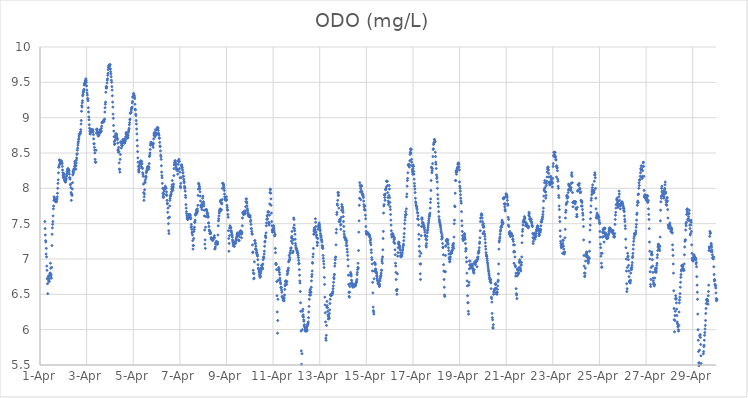
| Category | ODO (mg/L) |
|---|---|
| 44287.208333333336 | 7.53 |
| 44287.21875 | 7.43 |
| 44287.229166666664 | 7.34 |
| 44287.239583333336 | 7.26 |
| 44287.25 | 7.24 |
| 44287.260416666664 | 7.07 |
| 44287.270833333336 | 7.15 |
| 44287.28125 | 7.03 |
| 44287.291666666664 | 6.9 |
| 44287.302083333336 | 6.84 |
| 44287.3125 | 6.72 |
| 44287.322916666664 | 6.65 |
| 44287.333333333336 | 6.51 |
| 44287.34375 | 6.74 |
| 44287.354166666664 | 6.73 |
| 44287.364583333336 | 6.76 |
| 44287.375 | 6.69 |
| 44287.385416666664 | 6.69 |
| 44287.395833333336 | 6.68 |
| 44287.40625 | 6.72 |
| 44287.416666666664 | 6.77 |
| 44287.427083333336 | 6.8 |
| 44287.4375 | 6.8 |
| 44287.447916666664 | 6.94 |
| 44287.458333333336 | 6.87 |
| 44287.46875 | 6.76 |
| 44287.479166666664 | 6.78 |
| 44287.489583333336 | 6.73 |
| 44287.5 | 6.88 |
| 44287.510416666664 | 7.19 |
| 44287.520833333336 | 7.35 |
| 44287.53125 | 7.44 |
| 44287.541666666664 | 7.49 |
| 44287.552083333336 | 7.53 |
| 44287.5625 | 7.61 |
| 44287.572916666664 | 7.71 |
| 44287.583333333336 | 7.75 |
| 44287.59375 | 7.83 |
| 44287.604166666664 | 7.88 |
| 44287.614583333336 | 7.87 |
| 44287.625 | 7.85 |
| 44287.635416666664 | 7.84 |
| 44287.645833333336 | 7.84 |
| 44287.65625 | 7.82 |
| 44287.666666666664 | 7.82 |
| 44287.677083333336 | 7.81 |
| 44287.6875 | 7.81 |
| 44287.697916666664 | 7.82 |
| 44287.708333333336 | 7.81 |
| 44287.71875 | 7.84 |
| 44287.729166666664 | 7.85 |
| 44287.739583333336 | 7.88 |
| 44287.75 | 7.93 |
| 44287.760416666664 | 8 |
| 44287.770833333336 | 8.07 |
| 44287.78125 | 8.12 |
| 44287.791666666664 | 8.22 |
| 44287.802083333336 | 8.3 |
| 44287.8125 | 8.3 |
| 44287.822916666664 | 8.33 |
| 44287.833333333336 | 8.4 |
| 44287.84375 | 8.4 |
| 44287.854166666664 | 8.38 |
| 44287.864583333336 | 8.35 |
| 44287.875 | 8.35 |
| 44287.885416666664 | 8.37 |
| 44287.895833333336 | 8.38 |
| 44287.90625 | 8.38 |
| 44287.916666666664 | 8.39 |
| 44287.927083333336 | 8.37 |
| 44287.9375 | 8.36 |
| 44287.947916666664 | 8.35 |
| 44287.958333333336 | 8.31 |
| 44287.96875 | 8.26 |
| 44287.979166666664 | 8.22 |
| 44287.989583333336 | 8.18 |
| 44288.0 | 8.15 |
| 44288.010416666664 | 8.21 |
| 44288.020833333336 | 8.2 |
| 44288.03125 | 8.2 |
| 44288.041666666664 | 8.16 |
| 44288.052083333336 | 8.12 |
| 44288.0625 | 8.11 |
| 44288.072916666664 | 8.1 |
| 44288.083333333336 | 8.09 |
| 44288.09375 | 8.09 |
| 44288.104166666664 | 8.11 |
| 44288.114583333336 | 8.13 |
| 44288.125 | 8.14 |
| 44288.135416666664 | 8.17 |
| 44288.145833333336 | 8.19 |
| 44288.15625 | 8.21 |
| 44288.166666666664 | 8.24 |
| 44288.177083333336 | 8.26 |
| 44288.1875 | 8.27 |
| 44288.197916666664 | 8.27 |
| 44288.208333333336 | 8.28 |
| 44288.21875 | 8.25 |
| 44288.229166666664 | 8.26 |
| 44288.239583333336 | 8.23 |
| 44288.25 | 8.25 |
| 44288.260416666664 | 8.2 |
| 44288.270833333336 | 8.15 |
| 44288.28125 | 8.15 |
| 44288.291666666664 | 8.13 |
| 44288.302083333336 | 8.05 |
| 44288.3125 | 8.06 |
| 44288.322916666664 | 8.01 |
| 44288.333333333336 | 7.94 |
| 44288.34375 | 7.83 |
| 44288.354166666664 | 7.92 |
| 44288.364583333336 | 7.91 |
| 44288.375 | 7.9 |
| 44288.385416666664 | 7.99 |
| 44288.395833333336 | 8.08 |
| 44288.40625 | 8.19 |
| 44288.416666666664 | 8.24 |
| 44288.427083333336 | 8.21 |
| 44288.4375 | 8.23 |
| 44288.447916666664 | 8.27 |
| 44288.458333333336 | 8.27 |
| 44288.46875 | 8.27 |
| 44288.479166666664 | 8.31 |
| 44288.489583333336 | 8.38 |
| 44288.5 | 8.35 |
| 44288.510416666664 | 8.33 |
| 44288.520833333336 | 8.28 |
| 44288.53125 | 8.27 |
| 44288.541666666664 | 8.32 |
| 44288.552083333336 | 8.36 |
| 44288.5625 | 8.4 |
| 44288.572916666664 | 8.43 |
| 44288.583333333336 | 8.48 |
| 44288.59375 | 8.49 |
| 44288.604166666664 | 8.54 |
| 44288.614583333336 | 8.57 |
| 44288.625 | 8.61 |
| 44288.635416666664 | 8.64 |
| 44288.645833333336 | 8.66 |
| 44288.65625 | 8.69 |
| 44288.666666666664 | 8.71 |
| 44288.677083333336 | 8.74 |
| 44288.6875 | 8.76 |
| 44288.697916666664 | 8.77 |
| 44288.708333333336 | 8.77 |
| 44288.71875 | 8.77 |
| 44288.729166666664 | 8.78 |
| 44288.739583333336 | 8.8 |
| 44288.75 | 8.83 |
| 44288.760416666664 | 8.91 |
| 44288.770833333336 | 8.96 |
| 44288.78125 | 9.09 |
| 44288.791666666664 | 9.17 |
| 44288.802083333336 | 9.15 |
| 44288.8125 | 9.21 |
| 44288.822916666664 | 9.24 |
| 44288.833333333336 | 9.31 |
| 44288.84375 | 9.33 |
| 44288.854166666664 | 9.36 |
| 44288.864583333336 | 9.37 |
| 44288.875 | 9.39 |
| 44288.885416666664 | 9.4 |
| 44288.895833333336 | 9.46 |
| 44288.90625 | 9.48 |
| 44288.916666666664 | 9.49 |
| 44288.927083333336 | 9.47 |
| 44288.9375 | 9.52 |
| 44288.947916666664 | 9.52 |
| 44288.958333333336 | 9.53 |
| 44288.96875 | 9.55 |
| 44288.979166666664 | 9.53 |
| 44288.989583333336 | 9.5 |
| 44289.0 | 9.45 |
| 44289.010416666664 | 9.39 |
| 44289.020833333336 | 9.35 |
| 44289.03125 | 9.32 |
| 44289.041666666664 | 9.27 |
| 44289.052083333336 | 9.27 |
| 44289.0625 | 9.24 |
| 44289.072916666664 | 9.14 |
| 44289.083333333336 | 9.08 |
| 44289.09375 | 9.01 |
| 44289.104166666664 | 8.97 |
| 44289.114583333336 | 8.9 |
| 44289.125 | 8.85 |
| 44289.135416666664 | 8.81 |
| 44289.145833333336 | 8.77 |
| 44289.15625 | 8.77 |
| 44289.166666666664 | 8.79 |
| 44289.177083333336 | 8.81 |
| 44289.1875 | 8.81 |
| 44289.197916666664 | 8.82 |
| 44289.208333333336 | 8.83 |
| 44289.21875 | 8.82 |
| 44289.229166666664 | 8.83 |
| 44289.239583333336 | 8.83 |
| 44289.25 | 8.8 |
| 44289.260416666664 | 8.8 |
| 44289.270833333336 | 8.83 |
| 44289.28125 | 8.8 |
| 44289.291666666664 | 8.76 |
| 44289.302083333336 | 8.7 |
| 44289.3125 | 8.63 |
| 44289.322916666664 | 8.63 |
| 44289.333333333336 | 8.58 |
| 44289.34375 | 8.54 |
| 44289.354166666664 | 8.5 |
| 44289.364583333336 | 8.41 |
| 44289.375 | 8.37 |
| 44289.385416666664 | 8.37 |
| 44289.395833333336 | 8.37 |
| 44289.40625 | 8.54 |
| 44289.416666666664 | 8.78 |
| 44289.427083333336 | 8.83 |
| 44289.4375 | 8.84 |
| 44289.447916666664 | 8.83 |
| 44289.458333333336 | 8.8 |
| 44289.46875 | 8.79 |
| 44289.479166666664 | 8.78 |
| 44289.489583333336 | 8.75 |
| 44289.5 | 8.74 |
| 44289.510416666664 | 8.75 |
| 44289.520833333336 | 8.75 |
| 44289.53125 | 8.76 |
| 44289.541666666664 | 8.78 |
| 44289.552083333336 | 8.8 |
| 44289.5625 | 8.81 |
| 44289.572916666664 | 8.83 |
| 44289.583333333336 | 8.8 |
| 44289.59375 | 8.79 |
| 44289.604166666664 | 8.8 |
| 44289.614583333336 | 8.81 |
| 44289.625 | 8.81 |
| 44289.635416666664 | 8.85 |
| 44289.645833333336 | 8.88 |
| 44289.65625 | 8.93 |
| 44289.666666666664 | 8.93 |
| 44289.677083333336 | 8.94 |
| 44289.6875 | 8.94 |
| 44289.697916666664 | 8.94 |
| 44289.708333333336 | 8.94 |
| 44289.71875 | 8.95 |
| 44289.729166666664 | 8.94 |
| 44289.739583333336 | 8.95 |
| 44289.75 | 8.97 |
| 44289.760416666664 | 8.97 |
| 44289.770833333336 | 8.98 |
| 44289.78125 | 9.08 |
| 44289.791666666664 | 9.14 |
| 44289.802083333336 | 9.19 |
| 44289.8125 | 9.22 |
| 44289.822916666664 | 9.36 |
| 44289.833333333336 | 9.42 |
| 44289.84375 | 9.44 |
| 44289.854166666664 | 9.44 |
| 44289.864583333336 | 9.42 |
| 44289.875 | 9.49 |
| 44289.885416666664 | 9.53 |
| 44289.895833333336 | 9.55 |
| 44289.90625 | 9.6 |
| 44289.916666666664 | 9.63 |
| 44289.927083333336 | 9.68 |
| 44289.9375 | 9.71 |
| 44289.947916666664 | 9.73 |
| 44289.958333333336 | 9.74 |
| 44289.96875 | 9.74 |
| 44289.979166666664 | 9.75 |
| 44289.989583333336 | 9.73 |
| 44290.0 | 9.69 |
| 44290.010416666664 | 9.75 |
| 44290.020833333336 | 9.69 |
| 44290.03125 | 9.65 |
| 44290.041666666664 | 9.62 |
| 44290.052083333336 | 9.58 |
| 44290.0625 | 9.53 |
| 44290.072916666664 | 9.5 |
| 44290.083333333336 | 9.44 |
| 44290.09375 | 9.39 |
| 44290.104166666664 | 9.31 |
| 44290.114583333336 | 9.22 |
| 44290.125 | 9.15 |
| 44290.135416666664 | 9.05 |
| 44290.145833333336 | 8.99 |
| 44290.15625 | 8.89 |
| 44290.166666666664 | 8.81 |
| 44290.177083333336 | 8.73 |
| 44290.1875 | 8.66 |
| 44290.197916666664 | 8.62 |
| 44290.208333333336 | 8.63 |
| 44290.21875 | 8.68 |
| 44290.229166666664 | 8.72 |
| 44290.239583333336 | 8.75 |
| 44290.25 | 8.77 |
| 44290.260416666664 | 8.77 |
| 44290.270833333336 | 8.77 |
| 44290.28125 | 8.76 |
| 44290.291666666664 | 8.74 |
| 44290.302083333336 | 8.71 |
| 44290.3125 | 8.71 |
| 44290.322916666664 | 8.69 |
| 44290.333333333336 | 8.64 |
| 44290.34375 | 8.54 |
| 44290.354166666664 | 8.55 |
| 44290.364583333336 | 8.51 |
| 44290.375 | 8.58 |
| 44290.385416666664 | 8.52 |
| 44290.395833333336 | 8.36 |
| 44290.40625 | 8.27 |
| 44290.416666666664 | 8.27 |
| 44290.427083333336 | 8.23 |
| 44290.4375 | 8.41 |
| 44290.447916666664 | 8.48 |
| 44290.458333333336 | 8.65 |
| 44290.46875 | 8.66 |
| 44290.479166666664 | 8.65 |
| 44290.489583333336 | 8.57 |
| 44290.5 | 8.61 |
| 44290.510416666664 | 8.61 |
| 44290.520833333336 | 8.6 |
| 44290.53125 | 8.61 |
| 44290.541666666664 | 8.64 |
| 44290.552083333336 | 8.69 |
| 44290.5625 | 8.67 |
| 44290.572916666664 | 8.66 |
| 44290.583333333336 | 8.66 |
| 44290.59375 | 8.65 |
| 44290.604166666664 | 8.67 |
| 44290.614583333336 | 8.7 |
| 44290.625 | 8.64 |
| 44290.635416666664 | 8.64 |
| 44290.645833333336 | 8.66 |
| 44290.65625 | 8.67 |
| 44290.666666666664 | 8.69 |
| 44290.677083333336 | 8.73 |
| 44290.6875 | 8.77 |
| 44290.697916666664 | 8.79 |
| 44290.708333333336 | 8.78 |
| 44290.71875 | 8.76 |
| 44290.729166666664 | 8.75 |
| 44290.739583333336 | 8.72 |
| 44290.75 | 8.72 |
| 44290.760416666664 | 8.71 |
| 44290.770833333336 | 8.72 |
| 44290.78125 | 8.75 |
| 44290.791666666664 | 8.79 |
| 44290.802083333336 | 8.81 |
| 44290.8125 | 8.83 |
| 44290.822916666664 | 8.85 |
| 44290.833333333336 | 8.9 |
| 44290.84375 | 8.93 |
| 44290.854166666664 | 8.97 |
| 44290.864583333336 | 8.98 |
| 44290.875 | 9.06 |
| 44290.885416666664 | 9.07 |
| 44290.895833333336 | 9.07 |
| 44290.90625 | 9.08 |
| 44290.916666666664 | 9.11 |
| 44290.927083333336 | 9.13 |
| 44290.9375 | 9.14 |
| 44290.947916666664 | 9.15 |
| 44290.958333333336 | 9.21 |
| 44290.96875 | 9.23 |
| 44290.979166666664 | 9.29 |
| 44290.989583333336 | 9.3 |
| 44291.0 | 9.3 |
| 44291.010416666664 | 9.34 |
| 44291.020833333336 | 9.34 |
| 44291.03125 | 9.32 |
| 44291.041666666664 | 9.31 |
| 44291.052083333336 | 9.29 |
| 44291.0625 | 9.27 |
| 44291.072916666664 | 9.19 |
| 44291.083333333336 | 9.12 |
| 44291.09375 | 9.11 |
| 44291.104166666664 | 9.05 |
| 44291.114583333336 | 9.03 |
| 44291.125 | 8.96 |
| 44291.135416666664 | 8.91 |
| 44291.145833333336 | 8.84 |
| 44291.15625 | 8.77 |
| 44291.166666666664 | 8.68 |
| 44291.177083333336 | 8.6 |
| 44291.1875 | 8.52 |
| 44291.197916666664 | 8.43 |
| 44291.208333333336 | 8.37 |
| 44291.21875 | 8.31 |
| 44291.229166666664 | 8.26 |
| 44291.239583333336 | 8.23 |
| 44291.25 | 8.24 |
| 44291.260416666664 | 8.28 |
| 44291.270833333336 | 8.31 |
| 44291.28125 | 8.34 |
| 44291.291666666664 | 8.36 |
| 44291.302083333336 | 8.37 |
| 44291.3125 | 8.38 |
| 44291.322916666664 | 8.39 |
| 44291.333333333336 | 8.35 |
| 44291.34375 | 8.31 |
| 44291.354166666664 | 8.34 |
| 44291.364583333336 | 8.38 |
| 44291.375 | 8.35 |
| 44291.385416666664 | 8.29 |
| 44291.395833333336 | 8.28 |
| 44291.40625 | 8.22 |
| 44291.416666666664 | 8.2 |
| 44291.427083333336 | 8.17 |
| 44291.4375 | 8.06 |
| 44291.447916666664 | 7.94 |
| 44291.458333333336 | 7.83 |
| 44291.46875 | 7.88 |
| 44291.479166666664 | 7.92 |
| 44291.489583333336 | 7.98 |
| 44291.5 | 8.09 |
| 44291.510416666664 | 8.08 |
| 44291.520833333336 | 8.12 |
| 44291.53125 | 8.17 |
| 44291.541666666664 | 8.15 |
| 44291.552083333336 | 8.17 |
| 44291.5625 | 8.22 |
| 44291.572916666664 | 8.24 |
| 44291.583333333336 | 8.25 |
| 44291.59375 | 8.27 |
| 44291.604166666664 | 8.28 |
| 44291.614583333336 | 8.3 |
| 44291.625 | 8.31 |
| 44291.635416666664 | 8.31 |
| 44291.645833333336 | 8.3 |
| 44291.65625 | 8.3 |
| 44291.666666666664 | 8.27 |
| 44291.677083333336 | 8.3 |
| 44291.6875 | 8.35 |
| 44291.697916666664 | 8.45 |
| 44291.708333333336 | 8.47 |
| 44291.71875 | 8.5 |
| 44291.729166666664 | 8.55 |
| 44291.739583333336 | 8.61 |
| 44291.75 | 8.63 |
| 44291.760416666664 | 8.65 |
| 44291.770833333336 | 8.65 |
| 44291.78125 | 8.63 |
| 44291.791666666664 | 8.64 |
| 44291.802083333336 | 8.64 |
| 44291.8125 | 8.62 |
| 44291.822916666664 | 8.61 |
| 44291.833333333336 | 8.62 |
| 44291.84375 | 8.62 |
| 44291.854166666664 | 8.58 |
| 44291.864583333336 | 8.64 |
| 44291.875 | 8.7 |
| 44291.885416666664 | 8.77 |
| 44291.895833333336 | 8.75 |
| 44291.90625 | 8.79 |
| 44291.916666666664 | 8.76 |
| 44291.927083333336 | 8.76 |
| 44291.9375 | 8.73 |
| 44291.947916666664 | 8.83 |
| 44291.958333333336 | 8.79 |
| 44291.96875 | 8.76 |
| 44291.979166666664 | 8.76 |
| 44291.989583333336 | 8.78 |
| 44292.0 | 8.77 |
| 44292.010416666664 | 8.83 |
| 44292.020833333336 | 8.83 |
| 44292.03125 | 8.86 |
| 44292.041666666664 | 8.84 |
| 44292.052083333336 | 8.86 |
| 44292.0625 | 8.85 |
| 44292.072916666664 | 8.82 |
| 44292.083333333336 | 8.78 |
| 44292.09375 | 8.77 |
| 44292.104166666664 | 8.75 |
| 44292.114583333336 | 8.71 |
| 44292.125 | 8.71 |
| 44292.135416666664 | 8.65 |
| 44292.145833333336 | 8.6 |
| 44292.15625 | 8.59 |
| 44292.166666666664 | 8.53 |
| 44292.177083333336 | 8.47 |
| 44292.1875 | 8.45 |
| 44292.197916666664 | 8.41 |
| 44292.208333333336 | 8.32 |
| 44292.21875 | 8.23 |
| 44292.229166666664 | 8.18 |
| 44292.239583333336 | 8.15 |
| 44292.25 | 8.07 |
| 44292.260416666664 | 8 |
| 44292.270833333336 | 7.93 |
| 44292.28125 | 7.89 |
| 44292.291666666664 | 7.87 |
| 44292.302083333336 | 7.88 |
| 44292.3125 | 7.92 |
| 44292.322916666664 | 7.96 |
| 44292.333333333336 | 7.98 |
| 44292.34375 | 8 |
| 44292.354166666664 | 8.01 |
| 44292.364583333336 | 8.01 |
| 44292.375 | 8.03 |
| 44292.385416666664 | 8 |
| 44292.395833333336 | 8.01 |
| 44292.40625 | 8 |
| 44292.416666666664 | 7.91 |
| 44292.427083333336 | 7.95 |
| 44292.4375 | 7.9 |
| 44292.447916666664 | 7.83 |
| 44292.458333333336 | 7.78 |
| 44292.46875 | 7.79 |
| 44292.479166666664 | 7.66 |
| 44292.489583333336 | 7.72 |
| 44292.5 | 7.58 |
| 44292.510416666664 | 7.5 |
| 44292.520833333336 | 7.4 |
| 44292.53125 | 7.36 |
| 44292.541666666664 | 7.59 |
| 44292.552083333336 | 7.59 |
| 44292.5625 | 7.75 |
| 44292.572916666664 | 7.83 |
| 44292.583333333336 | 7.86 |
| 44292.59375 | 7.89 |
| 44292.604166666664 | 7.9 |
| 44292.614583333336 | 7.91 |
| 44292.625 | 7.92 |
| 44292.635416666664 | 7.95 |
| 44292.645833333336 | 7.99 |
| 44292.65625 | 8.02 |
| 44292.666666666664 | 8.05 |
| 44292.677083333336 | 8.11 |
| 44292.6875 | 7.99 |
| 44292.697916666664 | 7.97 |
| 44292.708333333336 | 8.01 |
| 44292.71875 | 8.03 |
| 44292.729166666664 | 8.06 |
| 44292.739583333336 | 8.18 |
| 44292.75 | 8.28 |
| 44292.760416666664 | 8.33 |
| 44292.770833333336 | 8.36 |
| 44292.78125 | 8.37 |
| 44292.791666666664 | 8.39 |
| 44292.802083333336 | 8.39 |
| 44292.8125 | 8.37 |
| 44292.822916666664 | 8.35 |
| 44292.833333333336 | 8.33 |
| 44292.84375 | 8.3 |
| 44292.854166666664 | 8.27 |
| 44292.864583333336 | 8.26 |
| 44292.875 | 8.26 |
| 44292.885416666664 | 8.27 |
| 44292.895833333336 | 8.27 |
| 44292.90625 | 8.2 |
| 44292.916666666664 | 8.25 |
| 44292.927083333336 | 8.34 |
| 44292.9375 | 8.39 |
| 44292.947916666664 | 8.38 |
| 44292.958333333336 | 8.41 |
| 44292.96875 | 8.38 |
| 44292.979166666664 | 8.38 |
| 44292.989583333336 | 8.28 |
| 44293.0 | 8.23 |
| 44293.010416666664 | 8.15 |
| 44293.020833333336 | 8.03 |
| 44293.03125 | 8.01 |
| 44293.041666666664 | 8.07 |
| 44293.052083333336 | 8.15 |
| 44293.0625 | 8.32 |
| 44293.072916666664 | 8.33 |
| 44293.083333333336 | 8.33 |
| 44293.09375 | 8.3 |
| 44293.104166666664 | 8.29 |
| 44293.114583333336 | 8.26 |
| 44293.125 | 8.22 |
| 44293.135416666664 | 8.22 |
| 44293.145833333336 | 8.17 |
| 44293.15625 | 8.17 |
| 44293.166666666664 | 8.13 |
| 44293.177083333336 | 8.1 |
| 44293.1875 | 8.08 |
| 44293.197916666664 | 8.03 |
| 44293.208333333336 | 8 |
| 44293.21875 | 8.01 |
| 44293.229166666664 | 7.96 |
| 44293.239583333336 | 7.9 |
| 44293.25 | 7.87 |
| 44293.260416666664 | 7.77 |
| 44293.270833333336 | 7.72 |
| 44293.28125 | 7.67 |
| 44293.291666666664 | 7.64 |
| 44293.302083333336 | 7.61 |
| 44293.3125 | 7.58 |
| 44293.322916666664 | 7.57 |
| 44293.333333333336 | 7.56 |
| 44293.34375 | 7.56 |
| 44293.354166666664 | 7.57 |
| 44293.364583333336 | 7.58 |
| 44293.375 | 7.6 |
| 44293.385416666664 | 7.62 |
| 44293.395833333336 | 7.63 |
| 44293.40625 | 7.63 |
| 44293.416666666664 | 7.63 |
| 44293.427083333336 | 7.63 |
| 44293.4375 | 7.58 |
| 44293.447916666664 | 7.62 |
| 44293.458333333336 | 7.59 |
| 44293.46875 | 7.57 |
| 44293.479166666664 | 7.45 |
| 44293.489583333336 | 7.49 |
| 44293.5 | 7.46 |
| 44293.510416666664 | 7.42 |
| 44293.520833333336 | 7.37 |
| 44293.53125 | 7.38 |
| 44293.541666666664 | 7.34 |
| 44293.552083333336 | 7.26 |
| 44293.5625 | 7.14 |
| 44293.572916666664 | 7.19 |
| 44293.583333333336 | 7.19 |
| 44293.59375 | 7.29 |
| 44293.604166666664 | 7.39 |
| 44293.614583333336 | 7.42 |
| 44293.625 | 7.45 |
| 44293.635416666664 | 7.52 |
| 44293.645833333336 | 7.52 |
| 44293.65625 | 7.55 |
| 44293.666666666664 | 7.62 |
| 44293.677083333336 | 7.64 |
| 44293.6875 | 7.63 |
| 44293.697916666664 | 7.65 |
| 44293.708333333336 | 7.68 |
| 44293.71875 | 7.7 |
| 44293.729166666664 | 7.66 |
| 44293.739583333336 | 7.65 |
| 44293.75 | 7.71 |
| 44293.760416666664 | 7.68 |
| 44293.770833333336 | 7.76 |
| 44293.78125 | 7.9 |
| 44293.791666666664 | 7.99 |
| 44293.802083333336 | 8.07 |
| 44293.8125 | 8.06 |
| 44293.822916666664 | 8.06 |
| 44293.833333333336 | 8.03 |
| 44293.84375 | 8.02 |
| 44293.854166666664 | 7.99 |
| 44293.864583333336 | 7.95 |
| 44293.875 | 7.89 |
| 44293.885416666664 | 7.82 |
| 44293.895833333336 | 7.76 |
| 44293.90625 | 7.75 |
| 44293.916666666664 | 7.73 |
| 44293.927083333336 | 7.74 |
| 44293.9375 | 7.74 |
| 44293.947916666664 | 7.7 |
| 44293.958333333336 | 7.76 |
| 44293.96875 | 7.79 |
| 44293.979166666664 | 7.86 |
| 44293.989583333336 | 7.89 |
| 44294.0 | 7.8 |
| 44294.010416666664 | 7.81 |
| 44294.020833333336 | 7.78 |
| 44294.03125 | 7.75 |
| 44294.041666666664 | 7.69 |
| 44294.052083333336 | 7.61 |
| 44294.0625 | 7.41 |
| 44294.072916666664 | 7.21 |
| 44294.083333333336 | 7.27 |
| 44294.09375 | 7.15 |
| 44294.104166666664 | 7.45 |
| 44294.114583333336 | 7.6 |
| 44294.125 | 7.7 |
| 44294.135416666664 | 7.69 |
| 44294.145833333336 | 7.7 |
| 44294.15625 | 7.68 |
| 44294.166666666664 | 7.65 |
| 44294.177083333336 | 7.64 |
| 44294.1875 | 7.65 |
| 44294.197916666664 | 7.62 |
| 44294.208333333336 | 7.59 |
| 44294.21875 | 7.6 |
| 44294.229166666664 | 7.51 |
| 44294.239583333336 | 7.51 |
| 44294.25 | 7.46 |
| 44294.260416666664 | 7.41 |
| 44294.270833333336 | 7.4 |
| 44294.28125 | 7.39 |
| 44294.291666666664 | 7.36 |
| 44294.302083333336 | 7.36 |
| 44294.3125 | 7.38 |
| 44294.322916666664 | 7.36 |
| 44294.333333333336 | 7.3 |
| 44294.34375 | 7.28 |
| 44294.354166666664 | 7.29 |
| 44294.364583333336 | 7.3 |
| 44294.375 | 7.29 |
| 44294.385416666664 | 7.29 |
| 44294.395833333336 | 7.27 |
| 44294.40625 | 7.26 |
| 44294.416666666664 | 7.27 |
| 44294.427083333336 | 7.28 |
| 44294.4375 | 7.29 |
| 44294.447916666664 | 7.3 |
| 44294.458333333336 | 7.3 |
| 44294.46875 | 7.3 |
| 44294.479166666664 | 7.33 |
| 44294.489583333336 | 7.3 |
| 44294.5 | 7.14 |
| 44294.510416666664 | 7.15 |
| 44294.520833333336 | 7.17 |
| 44294.53125 | 7.21 |
| 44294.541666666664 | 7.23 |
| 44294.552083333336 | 7.22 |
| 44294.5625 | 7.25 |
| 44294.572916666664 | 7.23 |
| 44294.583333333336 | 7.21 |
| 44294.59375 | 7.22 |
| 44294.604166666664 | 7.21 |
| 44294.614583333336 | 7.21 |
| 44294.625 | 7.24 |
| 44294.635416666664 | 7.34 |
| 44294.645833333336 | 7.47 |
| 44294.65625 | 7.54 |
| 44294.666666666664 | 7.57 |
| 44294.677083333336 | 7.61 |
| 44294.6875 | 7.65 |
| 44294.697916666664 | 7.69 |
| 44294.708333333336 | 7.67 |
| 44294.71875 | 7.68 |
| 44294.729166666664 | 7.71 |
| 44294.739583333336 | 7.81 |
| 44294.75 | 7.83 |
| 44294.760416666664 | 7.83 |
| 44294.770833333336 | 7.69 |
| 44294.78125 | 7.7 |
| 44294.791666666664 | 7.78 |
| 44294.802083333336 | 7.79 |
| 44294.8125 | 7.84 |
| 44294.822916666664 | 8 |
| 44294.833333333336 | 8.07 |
| 44294.84375 | 8.07 |
| 44294.854166666664 | 8.07 |
| 44294.864583333336 | 8.05 |
| 44294.875 | 8.05 |
| 44294.885416666664 | 8.03 |
| 44294.895833333336 | 8 |
| 44294.90625 | 7.97 |
| 44294.916666666664 | 7.92 |
| 44294.927083333336 | 7.88 |
| 44294.9375 | 7.86 |
| 44294.947916666664 | 7.84 |
| 44294.958333333336 | 7.84 |
| 44294.96875 | 7.85 |
| 44294.979166666664 | 7.83 |
| 44294.989583333336 | 7.83 |
| 44295.0 | 7.88 |
| 44295.010416666664 | 7.84 |
| 44295.020833333336 | 7.76 |
| 44295.03125 | 7.73 |
| 44295.041666666664 | 7.7 |
| 44295.052083333336 | 7.69 |
| 44295.0625 | 7.63 |
| 44295.072916666664 | 7.59 |
| 44295.083333333336 | 7.4 |
| 44295.09375 | 7.29 |
| 44295.104166666664 | 7.11 |
| 44295.114583333336 | 7.22 |
| 44295.125 | 7.33 |
| 44295.135416666664 | 7.44 |
| 44295.145833333336 | 7.47 |
| 44295.15625 | 7.44 |
| 44295.166666666664 | 7.44 |
| 44295.177083333336 | 7.45 |
| 44295.1875 | 7.44 |
| 44295.197916666664 | 7.4 |
| 44295.208333333336 | 7.39 |
| 44295.21875 | 7.37 |
| 44295.229166666664 | 7.35 |
| 44295.239583333336 | 7.33 |
| 44295.25 | 7.31 |
| 44295.260416666664 | 7.27 |
| 44295.270833333336 | 7.25 |
| 44295.28125 | 7.23 |
| 44295.291666666664 | 7.19 |
| 44295.302083333336 | 7.21 |
| 44295.3125 | 7.22 |
| 44295.322916666664 | 7.18 |
| 44295.333333333336 | 7.18 |
| 44295.34375 | 7.22 |
| 44295.354166666664 | 7.24 |
| 44295.364583333336 | 7.23 |
| 44295.375 | 7.23 |
| 44295.385416666664 | 7.22 |
| 44295.395833333336 | 7.23 |
| 44295.40625 | 7.26 |
| 44295.416666666664 | 7.28 |
| 44295.427083333336 | 7.3 |
| 44295.4375 | 7.31 |
| 44295.447916666664 | 7.34 |
| 44295.458333333336 | 7.35 |
| 44295.46875 | 7.36 |
| 44295.479166666664 | 7.37 |
| 44295.489583333336 | 7.33 |
| 44295.5 | 7.34 |
| 44295.510416666664 | 7.34 |
| 44295.520833333336 | 7.27 |
| 44295.53125 | 7.26 |
| 44295.541666666664 | 7.26 |
| 44295.552083333336 | 7.32 |
| 44295.5625 | 7.36 |
| 44295.572916666664 | 7.38 |
| 44295.583333333336 | 7.39 |
| 44295.59375 | 7.37 |
| 44295.604166666664 | 7.39 |
| 44295.614583333336 | 7.4 |
| 44295.625 | 7.37 |
| 44295.635416666664 | 7.35 |
| 44295.645833333336 | 7.3 |
| 44295.65625 | 7.36 |
| 44295.666666666664 | 7.38 |
| 44295.677083333336 | 7.47 |
| 44295.6875 | 7.58 |
| 44295.697916666664 | 7.65 |
| 44295.708333333336 | 7.66 |
| 44295.71875 | 7.66 |
| 44295.729166666664 | 7.63 |
| 44295.739583333336 | 7.63 |
| 44295.75 | 7.64 |
| 44295.760416666664 | 7.66 |
| 44295.770833333336 | 7.68 |
| 44295.78125 | 7.67 |
| 44295.791666666664 | 7.64 |
| 44295.802083333336 | 7.64 |
| 44295.8125 | 7.68 |
| 44295.822916666664 | 7.74 |
| 44295.833333333336 | 7.81 |
| 44295.84375 | 7.85 |
| 44295.854166666664 | 7.85 |
| 44295.864583333336 | 7.81 |
| 44295.875 | 7.79 |
| 44295.885416666664 | 7.75 |
| 44295.895833333336 | 7.71 |
| 44295.90625 | 7.69 |
| 44295.916666666664 | 7.66 |
| 44295.927083333336 | 7.64 |
| 44295.9375 | 7.62 |
| 44295.947916666664 | 7.61 |
| 44295.958333333336 | 7.61 |
| 44295.96875 | 7.6 |
| 44295.979166666664 | 7.6 |
| 44295.989583333336 | 7.61 |
| 44296.0 | 7.62 |
| 44296.010416666664 | 7.61 |
| 44296.020833333336 | 7.59 |
| 44296.03125 | 7.53 |
| 44296.041666666664 | 7.55 |
| 44296.052083333336 | 7.49 |
| 44296.0625 | 7.43 |
| 44296.072916666664 | 7.43 |
| 44296.083333333336 | 7.39 |
| 44296.09375 | 7.36 |
| 44296.104166666664 | 7.35 |
| 44296.114583333336 | 7.2 |
| 44296.125 | 7.09 |
| 44296.135416666664 | 7.1 |
| 44296.145833333336 | 6.84 |
| 44296.15625 | 6.8 |
| 44296.166666666664 | 6.72 |
| 44296.177083333336 | 6.79 |
| 44296.1875 | 6.73 |
| 44296.197916666664 | 6.96 |
| 44296.208333333336 | 7.26 |
| 44296.21875 | 7.26 |
| 44296.229166666664 | 7.22 |
| 44296.239583333336 | 7.14 |
| 44296.25 | 7.22 |
| 44296.260416666664 | 7.18 |
| 44296.270833333336 | 7.14 |
| 44296.28125 | 7.09 |
| 44296.291666666664 | 7.12 |
| 44296.302083333336 | 7.09 |
| 44296.3125 | 7.06 |
| 44296.322916666664 | 7.06 |
| 44296.333333333336 | 7.04 |
| 44296.34375 | 6.99 |
| 44296.354166666664 | 6.92 |
| 44296.364583333336 | 6.87 |
| 44296.375 | 6.86 |
| 44296.385416666664 | 6.86 |
| 44296.395833333336 | 6.83 |
| 44296.40625 | 6.81 |
| 44296.416666666664 | 6.78 |
| 44296.427083333336 | 6.76 |
| 44296.4375 | 6.74 |
| 44296.447916666664 | 6.75 |
| 44296.458333333336 | 6.76 |
| 44296.46875 | 6.8 |
| 44296.479166666664 | 6.83 |
| 44296.489583333336 | 6.86 |
| 44296.5 | 6.88 |
| 44296.510416666664 | 6.91 |
| 44296.520833333336 | 6.91 |
| 44296.53125 | 6.88 |
| 44296.541666666664 | 6.87 |
| 44296.552083333336 | 6.86 |
| 44296.5625 | 6.93 |
| 44296.572916666664 | 6.99 |
| 44296.583333333336 | 7.02 |
| 44296.59375 | 7.03 |
| 44296.604166666664 | 7.02 |
| 44296.614583333336 | 7.07 |
| 44296.625 | 7.11 |
| 44296.635416666664 | 7.18 |
| 44296.645833333336 | 7.24 |
| 44296.65625 | 7.25 |
| 44296.666666666664 | 7.33 |
| 44296.677083333336 | 7.32 |
| 44296.6875 | 7.3 |
| 44296.697916666664 | 7.37 |
| 44296.708333333336 | 7.47 |
| 44296.71875 | 7.51 |
| 44296.729166666664 | 7.56 |
| 44296.739583333336 | 7.61 |
| 44296.75 | 7.57 |
| 44296.760416666664 | 7.57 |
| 44296.770833333336 | 7.62 |
| 44296.78125 | 7.67 |
| 44296.791666666664 | 7.66 |
| 44296.802083333336 | 7.67 |
| 44296.8125 | 7.52 |
| 44296.822916666664 | 7.48 |
| 44296.833333333336 | 7.5 |
| 44296.84375 | 7.62 |
| 44296.854166666664 | 7.78 |
| 44296.864583333336 | 7.94 |
| 44296.875 | 7.99 |
| 44296.885416666664 | 7.98 |
| 44296.895833333336 | 7.93 |
| 44296.90625 | 7.85 |
| 44296.916666666664 | 7.76 |
| 44296.927083333336 | 7.65 |
| 44296.9375 | 7.53 |
| 44296.947916666664 | 7.47 |
| 44296.958333333336 | 7.41 |
| 44296.96875 | 7.38 |
| 44296.979166666664 | 7.41 |
| 44296.989583333336 | 7.4 |
| 44297.0 | 7.43 |
| 44297.010416666664 | 7.47 |
| 44297.020833333336 | 7.47 |
| 44297.03125 | 7.44 |
| 44297.041666666664 | 7.41 |
| 44297.052083333336 | 7.38 |
| 44297.0625 | 7.33 |
| 44297.072916666664 | 7.33 |
| 44297.083333333336 | 7.35 |
| 44297.09375 | 7.15 |
| 44297.104166666664 | 7.09 |
| 44297.114583333336 | 6.93 |
| 44297.125 | 6.94 |
| 44297.135416666664 | 6.92 |
| 44297.145833333336 | 6.85 |
| 44297.15625 | 6.68 |
| 44297.166666666664 | 6.48 |
| 44297.177083333336 | 6.25 |
| 44297.1875 | 5.95 |
| 44297.197916666664 | 6.13 |
| 44297.208333333336 | 6.43 |
| 44297.21875 | 6.7 |
| 44297.229166666664 | 6.84 |
| 44297.239583333336 | 6.88 |
| 44297.25 | 6.86 |
| 44297.260416666664 | 6.85 |
| 44297.270833333336 | 6.81 |
| 44297.28125 | 6.78 |
| 44297.291666666664 | 6.73 |
| 44297.302083333336 | 6.7 |
| 44297.3125 | 6.67 |
| 44297.322916666664 | 6.65 |
| 44297.333333333336 | 6.6 |
| 44297.34375 | 6.59 |
| 44297.354166666664 | 6.6 |
| 44297.364583333336 | 6.56 |
| 44297.375 | 6.53 |
| 44297.385416666664 | 6.47 |
| 44297.395833333336 | 6.46 |
| 44297.40625 | 6.46 |
| 44297.416666666664 | 6.46 |
| 44297.427083333336 | 6.44 |
| 44297.4375 | 6.43 |
| 44297.447916666664 | 6.41 |
| 44297.458333333336 | 6.42 |
| 44297.46875 | 6.41 |
| 44297.479166666664 | 6.45 |
| 44297.489583333336 | 6.49 |
| 44297.5 | 6.57 |
| 44297.510416666664 | 6.62 |
| 44297.520833333336 | 6.64 |
| 44297.53125 | 6.68 |
| 44297.541666666664 | 6.69 |
| 44297.552083333336 | 6.69 |
| 44297.5625 | 6.68 |
| 44297.572916666664 | 6.68 |
| 44297.583333333336 | 6.64 |
| 44297.59375 | 6.68 |
| 44297.604166666664 | 6.78 |
| 44297.614583333336 | 6.83 |
| 44297.625 | 6.8 |
| 44297.635416666664 | 6.84 |
| 44297.645833333336 | 6.84 |
| 44297.65625 | 6.87 |
| 44297.666666666664 | 6.96 |
| 44297.677083333336 | 6.97 |
| 44297.6875 | 7.05 |
| 44297.697916666664 | 6.99 |
| 44297.708333333336 | 6.99 |
| 44297.71875 | 7.02 |
| 44297.729166666664 | 7.09 |
| 44297.739583333336 | 7.08 |
| 44297.75 | 7.12 |
| 44297.760416666664 | 7.15 |
| 44297.770833333336 | 7.16 |
| 44297.78125 | 7.25 |
| 44297.791666666664 | 7.3 |
| 44297.802083333336 | 7.32 |
| 44297.8125 | 7.39 |
| 44297.822916666664 | 7.29 |
| 44297.833333333336 | 7.22 |
| 44297.84375 | 7.09 |
| 44297.854166666664 | 7.11 |
| 44297.864583333336 | 7.27 |
| 44297.875 | 7.44 |
| 44297.885416666664 | 7.58 |
| 44297.895833333336 | 7.56 |
| 44297.90625 | 7.48 |
| 44297.916666666664 | 7.43 |
| 44297.927083333336 | 7.4 |
| 44297.9375 | 7.35 |
| 44297.947916666664 | 7.28 |
| 44297.958333333336 | 7.22 |
| 44297.96875 | 7.19 |
| 44297.979166666664 | 7.16 |
| 44297.989583333336 | 7.14 |
| 44298.0 | 7.15 |
| 44298.010416666664 | 7.14 |
| 44298.020833333336 | 7.12 |
| 44298.03125 | 7.1 |
| 44298.041666666664 | 7.11 |
| 44298.052083333336 | 7.08 |
| 44298.0625 | 7.08 |
| 44298.072916666664 | 7.05 |
| 44298.083333333336 | 7.02 |
| 44298.09375 | 6.98 |
| 44298.104166666664 | 6.93 |
| 44298.114583333336 | 6.94 |
| 44298.125 | 6.85 |
| 44298.135416666664 | 6.77 |
| 44298.145833333336 | 6.69 |
| 44298.15625 | 6.66 |
| 44298.166666666664 | 6.54 |
| 44298.177083333336 | 6.38 |
| 44298.1875 | 6.26 |
| 44298.197916666664 | 5.98 |
| 44298.208333333336 | 5.7 |
| 44298.21875 | 5.51 |
| 44298.229166666664 | 5.48 |
| 44298.239583333336 | 5.66 |
| 44298.25 | 6 |
| 44298.260416666664 | 6.26 |
| 44298.270833333336 | 6.19 |
| 44298.28125 | 6.29 |
| 44298.291666666664 | 6.21 |
| 44298.302083333336 | 6.18 |
| 44298.3125 | 6.14 |
| 44298.322916666664 | 6.12 |
| 44298.333333333336 | 6.05 |
| 44298.34375 | 6.07 |
| 44298.354166666664 | 6.04 |
| 44298.364583333336 | 6 |
| 44298.375 | 5.98 |
| 44298.385416666664 | 6.02 |
| 44298.395833333336 | 6.03 |
| 44298.40625 | 5.98 |
| 44298.416666666664 | 6.02 |
| 44298.427083333336 | 6.03 |
| 44298.4375 | 6.01 |
| 44298.447916666664 | 5.98 |
| 44298.458333333336 | 5.99 |
| 44298.46875 | 6.05 |
| 44298.479166666664 | 6.07 |
| 44298.489583333336 | 6.08 |
| 44298.5 | 6.09 |
| 44298.510416666664 | 6.11 |
| 44298.520833333336 | 6.17 |
| 44298.53125 | 6.25 |
| 44298.541666666664 | 6.33 |
| 44298.552083333336 | 6.43 |
| 44298.5625 | 6.49 |
| 44298.572916666664 | 6.53 |
| 44298.583333333336 | 6.56 |
| 44298.59375 | 6.57 |
| 44298.604166666664 | 6.49 |
| 44298.614583333336 | 6.53 |
| 44298.625 | 6.53 |
| 44298.635416666664 | 6.6 |
| 44298.645833333336 | 6.69 |
| 44298.65625 | 6.75 |
| 44298.666666666664 | 6.78 |
| 44298.677083333336 | 6.83 |
| 44298.6875 | 6.95 |
| 44298.697916666664 | 6.94 |
| 44298.708333333336 | 7.03 |
| 44298.71875 | 7.07 |
| 44298.729166666664 | 7.15 |
| 44298.739583333336 | 7.35 |
| 44298.75 | 7.41 |
| 44298.760416666664 | 7.39 |
| 44298.770833333336 | 7.44 |
| 44298.78125 | 7.36 |
| 44298.791666666664 | 7.42 |
| 44298.802083333336 | 7.41 |
| 44298.8125 | 7.57 |
| 44298.822916666664 | 7.52 |
| 44298.833333333336 | 7.46 |
| 44298.84375 | 7.38 |
| 44298.854166666664 | 7.33 |
| 44298.864583333336 | 7.34 |
| 44298.875 | 7.3 |
| 44298.885416666664 | 7.24 |
| 44298.895833333336 | 7.19 |
| 44298.90625 | 7.23 |
| 44298.916666666664 | 7.29 |
| 44298.927083333336 | 7.42 |
| 44298.9375 | 7.46 |
| 44298.947916666664 | 7.46 |
| 44298.958333333336 | 7.46 |
| 44298.96875 | 7.49 |
| 44298.979166666664 | 7.51 |
| 44298.989583333336 | 7.48 |
| 44299.0 | 7.45 |
| 44299.010416666664 | 7.42 |
| 44299.020833333336 | 7.4 |
| 44299.03125 | 7.36 |
| 44299.041666666664 | 7.33 |
| 44299.052083333336 | 7.33 |
| 44299.0625 | 7.31 |
| 44299.072916666664 | 7.28 |
| 44299.083333333336 | 7.26 |
| 44299.09375 | 7.24 |
| 44299.104166666664 | 7.19 |
| 44299.114583333336 | 7.16 |
| 44299.125 | 7.18 |
| 44299.135416666664 | 7.15 |
| 44299.145833333336 | 7.05 |
| 44299.15625 | 7.01 |
| 44299.166666666664 | 6.97 |
| 44299.177083333336 | 6.93 |
| 44299.1875 | 6.88 |
| 44299.197916666664 | 6.74 |
| 44299.208333333336 | 6.64 |
| 44299.21875 | 6.46 |
| 44299.229166666664 | 6.35 |
| 44299.239583333336 | 6.24 |
| 44299.25 | 6.11 |
| 44299.260416666664 | 5.88 |
| 44299.270833333336 | 5.85 |
| 44299.28125 | 5.92 |
| 44299.291666666664 | 6.06 |
| 44299.302083333336 | 6.32 |
| 44299.3125 | 6.4 |
| 44299.322916666664 | 6.34 |
| 44299.333333333336 | 6.31 |
| 44299.34375 | 6.26 |
| 44299.354166666664 | 6.21 |
| 44299.364583333336 | 6.15 |
| 44299.375 | 6.19 |
| 44299.385416666664 | 6.19 |
| 44299.395833333336 | 6.17 |
| 44299.40625 | 6.16 |
| 44299.416666666664 | 6.23 |
| 44299.427083333336 | 6.28 |
| 44299.4375 | 6.37 |
| 44299.447916666664 | 6.43 |
| 44299.458333333336 | 6.49 |
| 44299.46875 | 6.49 |
| 44299.479166666664 | 6.48 |
| 44299.489583333336 | 6.5 |
| 44299.5 | 6.5 |
| 44299.510416666664 | 6.49 |
| 44299.520833333336 | 6.49 |
| 44299.53125 | 6.5 |
| 44299.541666666664 | 6.51 |
| 44299.552083333336 | 6.52 |
| 44299.5625 | 6.54 |
| 44299.572916666664 | 6.58 |
| 44299.583333333336 | 6.62 |
| 44299.59375 | 6.67 |
| 44299.604166666664 | 6.74 |
| 44299.614583333336 | 6.72 |
| 44299.625 | 6.78 |
| 44299.635416666664 | 6.78 |
| 44299.645833333336 | 6.9 |
| 44299.65625 | 6.94 |
| 44299.666666666664 | 6.99 |
| 44299.677083333336 | 7.02 |
| 44299.6875 | 7.03 |
| 44299.697916666664 | 7.2 |
| 44299.708333333336 | 7.37 |
| 44299.71875 | 7.42 |
| 44299.729166666664 | 7.63 |
| 44299.739583333336 | 7.66 |
| 44299.75 | 7.78 |
| 44299.760416666664 | 7.76 |
| 44299.770833333336 | 7.83 |
| 44299.78125 | 7.94 |
| 44299.791666666664 | 7.9 |
| 44299.802083333336 | 7.94 |
| 44299.8125 | 7.9 |
| 44299.822916666664 | 7.72 |
| 44299.833333333336 | 7.53 |
| 44299.84375 | 7.53 |
| 44299.854166666664 | 7.53 |
| 44299.864583333336 | 7.56 |
| 44299.875 | 7.56 |
| 44299.885416666664 | 7.54 |
| 44299.895833333336 | 7.48 |
| 44299.90625 | 7.42 |
| 44299.916666666664 | 7.49 |
| 44299.927083333336 | 7.59 |
| 44299.9375 | 7.69 |
| 44299.947916666664 | 7.77 |
| 44299.958333333336 | 7.74 |
| 44299.96875 | 7.74 |
| 44299.979166666664 | 7.72 |
| 44299.989583333336 | 7.69 |
| 44300.0 | 7.66 |
| 44300.010416666664 | 7.6 |
| 44300.020833333336 | 7.53 |
| 44300.03125 | 7.46 |
| 44300.041666666664 | 7.39 |
| 44300.052083333336 | 7.35 |
| 44300.0625 | 7.32 |
| 44300.072916666664 | 7.3 |
| 44300.083333333336 | 7.31 |
| 44300.09375 | 7.29 |
| 44300.104166666664 | 7.27 |
| 44300.114583333336 | 7.29 |
| 44300.125 | 7.27 |
| 44300.135416666664 | 7.19 |
| 44300.145833333336 | 7.23 |
| 44300.15625 | 7.26 |
| 44300.166666666664 | 7.19 |
| 44300.177083333336 | 7.14 |
| 44300.1875 | 7.1 |
| 44300.197916666664 | 7.05 |
| 44300.208333333336 | 6.99 |
| 44300.21875 | 6.9 |
| 44300.229166666664 | 6.77 |
| 44300.239583333336 | 6.64 |
| 44300.25 | 6.53 |
| 44300.260416666664 | 6.47 |
| 44300.270833333336 | 6.46 |
| 44300.28125 | 6.53 |
| 44300.291666666664 | 6.61 |
| 44300.302083333336 | 6.65 |
| 44300.3125 | 6.77 |
| 44300.322916666664 | 6.81 |
| 44300.333333333336 | 6.78 |
| 44300.34375 | 6.79 |
| 44300.354166666664 | 6.76 |
| 44300.364583333336 | 6.7 |
| 44300.375 | 6.67 |
| 44300.385416666664 | 6.63 |
| 44300.395833333336 | 6.65 |
| 44300.40625 | 6.63 |
| 44300.416666666664 | 6.61 |
| 44300.427083333336 | 6.6 |
| 44300.4375 | 6.61 |
| 44300.447916666664 | 6.64 |
| 44300.458333333336 | 6.64 |
| 44300.46875 | 6.62 |
| 44300.479166666664 | 6.61 |
| 44300.489583333336 | 6.63 |
| 44300.5 | 6.63 |
| 44300.510416666664 | 6.62 |
| 44300.520833333336 | 6.63 |
| 44300.53125 | 6.62 |
| 44300.541666666664 | 6.63 |
| 44300.552083333336 | 6.65 |
| 44300.5625 | 6.67 |
| 44300.572916666664 | 6.67 |
| 44300.583333333336 | 6.69 |
| 44300.59375 | 6.71 |
| 44300.604166666664 | 6.78 |
| 44300.614583333336 | 6.81 |
| 44300.625 | 6.85 |
| 44300.635416666664 | 6.88 |
| 44300.645833333336 | 6.94 |
| 44300.65625 | 6.87 |
| 44300.666666666664 | 7.12 |
| 44300.677083333336 | 7.38 |
| 44300.6875 | 7.54 |
| 44300.697916666664 | 7.76 |
| 44300.708333333336 | 7.86 |
| 44300.71875 | 8.08 |
| 44300.729166666664 | 8.04 |
| 44300.739583333336 | 7.95 |
| 44300.75 | 8 |
| 44300.760416666664 | 7.84 |
| 44300.770833333336 | 8.03 |
| 44300.78125 | 7.97 |
| 44300.791666666664 | 8.04 |
| 44300.802083333336 | 8.03 |
| 44300.8125 | 7.95 |
| 44300.822916666664 | 7.93 |
| 44300.833333333336 | 7.91 |
| 44300.84375 | 7.91 |
| 44300.854166666664 | 7.91 |
| 44300.864583333336 | 7.89 |
| 44300.875 | 7.87 |
| 44300.885416666664 | 7.82 |
| 44300.895833333336 | 7.77 |
| 44300.90625 | 7.74 |
| 44300.916666666664 | 7.7 |
| 44300.927083333336 | 7.7 |
| 44300.9375 | 7.75 |
| 44300.947916666664 | 7.69 |
| 44300.958333333336 | 7.62 |
| 44300.96875 | 7.57 |
| 44300.979166666664 | 7.46 |
| 44300.989583333336 | 7.39 |
| 44301.0 | 7.36 |
| 44301.010416666664 | 7.35 |
| 44301.020833333336 | 7.36 |
| 44301.03125 | 7.37 |
| 44301.041666666664 | 7.38 |
| 44301.052083333336 | 7.36 |
| 44301.0625 | 7.37 |
| 44301.072916666664 | 7.35 |
| 44301.083333333336 | 7.35 |
| 44301.09375 | 7.35 |
| 44301.104166666664 | 7.35 |
| 44301.114583333336 | 7.35 |
| 44301.125 | 7.34 |
| 44301.135416666664 | 7.33 |
| 44301.145833333336 | 7.31 |
| 44301.15625 | 7.31 |
| 44301.166666666664 | 7.26 |
| 44301.177083333336 | 7.23 |
| 44301.1875 | 7.28 |
| 44301.197916666664 | 7.2 |
| 44301.208333333336 | 7.13 |
| 44301.21875 | 7.09 |
| 44301.229166666664 | 7.02 |
| 44301.239583333336 | 6.99 |
| 44301.25 | 6.93 |
| 44301.260416666664 | 6.83 |
| 44301.270833333336 | 6.67 |
| 44301.28125 | 6.52 |
| 44301.291666666664 | 6.32 |
| 44301.302083333336 | 6.27 |
| 44301.3125 | 6.25 |
| 44301.322916666664 | 6.22 |
| 44301.333333333336 | 6.72 |
| 44301.34375 | 6.83 |
| 44301.354166666664 | 6.95 |
| 44301.364583333336 | 6.94 |
| 44301.375 | 6.94 |
| 44301.385416666664 | 6.92 |
| 44301.395833333336 | 6.86 |
| 44301.40625 | 6.85 |
| 44301.416666666664 | 6.81 |
| 44301.427083333336 | 6.82 |
| 44301.4375 | 6.8 |
| 44301.447916666664 | 6.77 |
| 44301.458333333336 | 6.75 |
| 44301.46875 | 6.72 |
| 44301.479166666664 | 6.7 |
| 44301.489583333336 | 6.68 |
| 44301.5 | 6.65 |
| 44301.510416666664 | 6.65 |
| 44301.520833333336 | 6.68 |
| 44301.53125 | 6.68 |
| 44301.541666666664 | 6.65 |
| 44301.552083333336 | 6.62 |
| 44301.5625 | 6.61 |
| 44301.572916666664 | 6.64 |
| 44301.583333333336 | 6.69 |
| 44301.59375 | 6.72 |
| 44301.604166666664 | 6.74 |
| 44301.614583333336 | 6.76 |
| 44301.625 | 6.77 |
| 44301.635416666664 | 6.8 |
| 44301.645833333336 | 6.84 |
| 44301.65625 | 6.84 |
| 44301.666666666664 | 6.97 |
| 44301.677083333336 | 7 |
| 44301.6875 | 6.94 |
| 44301.697916666664 | 7.03 |
| 44301.708333333336 | 7.13 |
| 44301.71875 | 7.29 |
| 44301.729166666664 | 7.39 |
| 44301.739583333336 | 7.65 |
| 44301.75 | 7.75 |
| 44301.760416666664 | 7.77 |
| 44301.770833333336 | 7.91 |
| 44301.78125 | 7.9 |
| 44301.791666666664 | 7.87 |
| 44301.802083333336 | 7.83 |
| 44301.8125 | 7.92 |
| 44301.822916666664 | 7.98 |
| 44301.833333333336 | 7.99 |
| 44301.84375 | 7.99 |
| 44301.854166666664 | 8.02 |
| 44301.864583333336 | 8.1 |
| 44301.875 | 8.1 |
| 44301.885416666664 | 8.1 |
| 44301.895833333336 | 8.1 |
| 44301.90625 | 8.04 |
| 44301.916666666664 | 7.94 |
| 44301.927083333336 | 7.87 |
| 44301.9375 | 7.82 |
| 44301.947916666664 | 7.77 |
| 44301.958333333336 | 7.8 |
| 44301.96875 | 7.9 |
| 44301.979166666664 | 8.04 |
| 44301.989583333336 | 7.99 |
| 44302.0 | 7.87 |
| 44302.010416666664 | 7.8 |
| 44302.020833333336 | 7.74 |
| 44302.03125 | 7.7 |
| 44302.041666666664 | 7.63 |
| 44302.052083333336 | 7.55 |
| 44302.0625 | 7.48 |
| 44302.072916666664 | 7.4 |
| 44302.083333333336 | 7.35 |
| 44302.09375 | 7.31 |
| 44302.104166666664 | 7.33 |
| 44302.114583333336 | 7.35 |
| 44302.125 | 7.36 |
| 44302.135416666664 | 7.35 |
| 44302.145833333336 | 7.34 |
| 44302.15625 | 7.32 |
| 44302.166666666664 | 7.32 |
| 44302.177083333336 | 7.24 |
| 44302.1875 | 7.27 |
| 44302.197916666664 | 7.28 |
| 44302.208333333336 | 7.3 |
| 44302.21875 | 7.22 |
| 44302.229166666664 | 7.13 |
| 44302.239583333336 | 7.06 |
| 44302.25 | 6.94 |
| 44302.260416666664 | 6.9 |
| 44302.270833333336 | 6.81 |
| 44302.28125 | 6.71 |
| 44302.291666666664 | 6.56 |
| 44302.302083333336 | 6.55 |
| 44302.3125 | 6.5 |
| 44302.322916666664 | 6.57 |
| 44302.333333333336 | 6.79 |
| 44302.34375 | 7.04 |
| 44302.354166666664 | 7.09 |
| 44302.364583333336 | 7.16 |
| 44302.375 | 7.21 |
| 44302.385416666664 | 7.24 |
| 44302.395833333336 | 7.23 |
| 44302.40625 | 7.23 |
| 44302.416666666664 | 7.18 |
| 44302.427083333336 | 7.19 |
| 44302.4375 | 7.16 |
| 44302.447916666664 | 7.13 |
| 44302.458333333336 | 7.09 |
| 44302.46875 | 7.05 |
| 44302.479166666664 | 7.03 |
| 44302.489583333336 | 7.04 |
| 44302.5 | 7.04 |
| 44302.510416666664 | 7.04 |
| 44302.520833333336 | 7.04 |
| 44302.53125 | 7.07 |
| 44302.541666666664 | 7.09 |
| 44302.552083333336 | 7.12 |
| 44302.5625 | 7.14 |
| 44302.572916666664 | 7.17 |
| 44302.583333333336 | 7.19 |
| 44302.59375 | 7.21 |
| 44302.604166666664 | 7.26 |
| 44302.614583333336 | 7.31 |
| 44302.625 | 7.36 |
| 44302.635416666664 | 7.43 |
| 44302.645833333336 | 7.5 |
| 44302.65625 | 7.55 |
| 44302.666666666664 | 7.59 |
| 44302.677083333336 | 7.62 |
| 44302.6875 | 7.67 |
| 44302.697916666664 | 7.63 |
| 44302.708333333336 | 7.63 |
| 44302.71875 | 7.71 |
| 44302.729166666664 | 7.88 |
| 44302.739583333336 | 7.92 |
| 44302.75 | 8.03 |
| 44302.760416666664 | 8.11 |
| 44302.770833333336 | 8.14 |
| 44302.78125 | 8.22 |
| 44302.791666666664 | 8.33 |
| 44302.802083333336 | 8.33 |
| 44302.8125 | 8.34 |
| 44302.822916666664 | 8.32 |
| 44302.833333333336 | 8.32 |
| 44302.84375 | 8.3 |
| 44302.854166666664 | 8.33 |
| 44302.864583333336 | 8.39 |
| 44302.875 | 8.48 |
| 44302.885416666664 | 8.51 |
| 44302.895833333336 | 8.55 |
| 44302.90625 | 8.56 |
| 44302.916666666664 | 8.5 |
| 44302.927083333336 | 8.55 |
| 44302.9375 | 8.41 |
| 44302.947916666664 | 8.37 |
| 44302.958333333336 | 8.32 |
| 44302.96875 | 8.26 |
| 44302.979166666664 | 8.23 |
| 44302.989583333336 | 8.2 |
| 44303.0 | 8.28 |
| 44303.010416666664 | 8.33 |
| 44303.020833333336 | 8.31 |
| 44303.03125 | 8.24 |
| 44303.041666666664 | 8.2 |
| 44303.052083333336 | 8.13 |
| 44303.0625 | 8.07 |
| 44303.072916666664 | 8.03 |
| 44303.083333333336 | 7.99 |
| 44303.09375 | 7.94 |
| 44303.104166666664 | 7.86 |
| 44303.114583333336 | 7.81 |
| 44303.125 | 7.79 |
| 44303.135416666664 | 7.76 |
| 44303.145833333336 | 7.75 |
| 44303.15625 | 7.74 |
| 44303.166666666664 | 7.72 |
| 44303.177083333336 | 7.7 |
| 44303.1875 | 7.66 |
| 44303.197916666664 | 7.57 |
| 44303.208333333336 | 7.65 |
| 44303.21875 | 7.61 |
| 44303.229166666664 | 7.56 |
| 44303.239583333336 | 7.48 |
| 44303.25 | 7.35 |
| 44303.260416666664 | 7.28 |
| 44303.270833333336 | 7.18 |
| 44303.28125 | 7.11 |
| 44303.291666666664 | 7.04 |
| 44303.302083333336 | 6.93 |
| 44303.3125 | 6.79 |
| 44303.322916666664 | 6.71 |
| 44303.333333333336 | 6.93 |
| 44303.34375 | 7.08 |
| 44303.354166666664 | 7.33 |
| 44303.364583333336 | 7.46 |
| 44303.375 | 7.58 |
| 44303.385416666664 | 7.56 |
| 44303.395833333336 | 7.58 |
| 44303.40625 | 7.52 |
| 44303.416666666664 | 7.5 |
| 44303.427083333336 | 7.5 |
| 44303.4375 | 7.51 |
| 44303.447916666664 | 7.48 |
| 44303.458333333336 | 7.46 |
| 44303.46875 | 7.44 |
| 44303.479166666664 | 7.47 |
| 44303.489583333336 | 7.44 |
| 44303.5 | 7.41 |
| 44303.510416666664 | 7.38 |
| 44303.520833333336 | 7.34 |
| 44303.53125 | 7.33 |
| 44303.541666666664 | 7.32 |
| 44303.552083333336 | 7.28 |
| 44303.5625 | 7.19 |
| 44303.572916666664 | 7.17 |
| 44303.583333333336 | 7.22 |
| 44303.59375 | 7.27 |
| 44303.604166666664 | 7.32 |
| 44303.614583333336 | 7.37 |
| 44303.625 | 7.4 |
| 44303.635416666664 | 7.42 |
| 44303.645833333336 | 7.45 |
| 44303.65625 | 7.48 |
| 44303.666666666664 | 7.51 |
| 44303.677083333336 | 7.54 |
| 44303.6875 | 7.57 |
| 44303.697916666664 | 7.6 |
| 44303.708333333336 | 7.63 |
| 44303.71875 | 7.61 |
| 44303.729166666664 | 7.65 |
| 44303.739583333336 | 7.72 |
| 44303.75 | 7.8 |
| 44303.760416666664 | 7.85 |
| 44303.770833333336 | 7.97 |
| 44303.78125 | 8.11 |
| 44303.791666666664 | 8.3 |
| 44303.802083333336 | 8.29 |
| 44303.8125 | 8.22 |
| 44303.822916666664 | 8.25 |
| 44303.833333333336 | 8.28 |
| 44303.84375 | 8.35 |
| 44303.854166666664 | 8.45 |
| 44303.864583333336 | 8.55 |
| 44303.875 | 8.56 |
| 44303.885416666664 | 8.62 |
| 44303.895833333336 | 8.63 |
| 44303.90625 | 8.65 |
| 44303.916666666664 | 8.69 |
| 44303.927083333336 | 8.69 |
| 44303.9375 | 8.66 |
| 44303.947916666664 | 8.66 |
| 44303.958333333336 | 8.51 |
| 44303.96875 | 8.45 |
| 44303.979166666664 | 8.37 |
| 44303.989583333336 | 8.34 |
| 44304.0 | 8.28 |
| 44304.010416666664 | 8.19 |
| 44304.020833333336 | 8.14 |
| 44304.03125 | 8.16 |
| 44304.041666666664 | 8.09 |
| 44304.052083333336 | 8 |
| 44304.0625 | 7.91 |
| 44304.072916666664 | 7.85 |
| 44304.083333333336 | 7.79 |
| 44304.09375 | 7.74 |
| 44304.104166666664 | 7.67 |
| 44304.114583333336 | 7.6 |
| 44304.125 | 7.56 |
| 44304.135416666664 | 7.54 |
| 44304.145833333336 | 7.52 |
| 44304.15625 | 7.51 |
| 44304.166666666664 | 7.49 |
| 44304.177083333336 | 7.47 |
| 44304.1875 | 7.45 |
| 44304.197916666664 | 7.42 |
| 44304.208333333336 | 7.39 |
| 44304.21875 | 7.37 |
| 44304.229166666664 | 7.28 |
| 44304.239583333336 | 7.32 |
| 44304.25 | 7.34 |
| 44304.260416666664 | 7.3 |
| 44304.270833333336 | 7.22 |
| 44304.28125 | 7.16 |
| 44304.291666666664 | 7.17 |
| 44304.302083333336 | 7.06 |
| 44304.3125 | 6.92 |
| 44304.322916666664 | 6.83 |
| 44304.333333333336 | 6.71 |
| 44304.34375 | 6.6 |
| 44304.354166666664 | 6.49 |
| 44304.364583333336 | 6.47 |
| 44304.375 | 6.82 |
| 44304.385416666664 | 6.82 |
| 44304.395833333336 | 7.05 |
| 44304.40625 | 7.18 |
| 44304.416666666664 | 7.19 |
| 44304.427083333336 | 7.26 |
| 44304.4375 | 7.25 |
| 44304.447916666664 | 7.27 |
| 44304.458333333336 | 7.28 |
| 44304.46875 | 7.26 |
| 44304.479166666664 | 7.24 |
| 44304.489583333336 | 7.22 |
| 44304.5 | 7.27 |
| 44304.510416666664 | 7.21 |
| 44304.520833333336 | 7.16 |
| 44304.53125 | 7.12 |
| 44304.541666666664 | 7.07 |
| 44304.552083333336 | 7.02 |
| 44304.5625 | 7 |
| 44304.572916666664 | 6.96 |
| 44304.583333333336 | 6.97 |
| 44304.59375 | 7 |
| 44304.604166666664 | 7.03 |
| 44304.614583333336 | 7.07 |
| 44304.625 | 7.09 |
| 44304.635416666664 | 7.08 |
| 44304.645833333336 | 7.09 |
| 44304.65625 | 7.08 |
| 44304.666666666664 | 7.1 |
| 44304.677083333336 | 7.12 |
| 44304.6875 | 7.12 |
| 44304.697916666664 | 7.16 |
| 44304.708333333336 | 7.19 |
| 44304.71875 | 7.21 |
| 44304.729166666664 | 7.18 |
| 44304.739583333336 | 7.22 |
| 44304.75 | 7.15 |
| 44304.760416666664 | 7.31 |
| 44304.770833333336 | 7.5 |
| 44304.78125 | 7.55 |
| 44304.791666666664 | 7.75 |
| 44304.802083333336 | 7.74 |
| 44304.8125 | 7.93 |
| 44304.822916666664 | 8.11 |
| 44304.833333333336 | 8.11 |
| 44304.84375 | 8.23 |
| 44304.854166666664 | 8.25 |
| 44304.864583333336 | 8.2 |
| 44304.875 | 8.23 |
| 44304.885416666664 | 8.25 |
| 44304.895833333336 | 8.28 |
| 44304.90625 | 8.29 |
| 44304.916666666664 | 8.3 |
| 44304.927083333336 | 8.34 |
| 44304.9375 | 8.35 |
| 44304.947916666664 | 8.36 |
| 44304.958333333336 | 8.35 |
| 44304.96875 | 8.34 |
| 44304.979166666664 | 8.3 |
| 44304.989583333336 | 8.26 |
| 44305.0 | 8.09 |
| 44305.010416666664 | 8.03 |
| 44305.020833333336 | 8 |
| 44305.03125 | 7.96 |
| 44305.041666666664 | 7.91 |
| 44305.052083333336 | 7.86 |
| 44305.0625 | 7.82 |
| 44305.072916666664 | 7.79 |
| 44305.083333333336 | 7.67 |
| 44305.09375 | 7.54 |
| 44305.104166666664 | 7.47 |
| 44305.114583333336 | 7.39 |
| 44305.125 | 7.33 |
| 44305.135416666664 | 7.29 |
| 44305.145833333336 | 7.28 |
| 44305.15625 | 7.26 |
| 44305.166666666664 | 7.27 |
| 44305.177083333336 | 7.28 |
| 44305.1875 | 7.29 |
| 44305.197916666664 | 7.33 |
| 44305.208333333336 | 7.36 |
| 44305.21875 | 7.35 |
| 44305.229166666664 | 7.31 |
| 44305.239583333336 | 7.28 |
| 44305.25 | 7.22 |
| 44305.260416666664 | 7.11 |
| 44305.270833333336 | 7.15 |
| 44305.28125 | 7.14 |
| 44305.291666666664 | 7.02 |
| 44305.302083333336 | 6.96 |
| 44305.3125 | 6.8 |
| 44305.322916666664 | 6.69 |
| 44305.333333333336 | 6.62 |
| 44305.34375 | 6.48 |
| 44305.354166666664 | 6.38 |
| 44305.364583333336 | 6.38 |
| 44305.375 | 6.26 |
| 44305.385416666664 | 6.22 |
| 44305.395833333336 | 6.63 |
| 44305.40625 | 6.67 |
| 44305.416666666664 | 6.86 |
| 44305.427083333336 | 6.97 |
| 44305.4375 | 6.92 |
| 44305.447916666664 | 6.97 |
| 44305.458333333336 | 6.91 |
| 44305.46875 | 6.91 |
| 44305.479166666664 | 6.88 |
| 44305.489583333336 | 6.9 |
| 44305.5 | 6.89 |
| 44305.510416666664 | 6.89 |
| 44305.520833333336 | 6.9 |
| 44305.53125 | 6.93 |
| 44305.541666666664 | 6.92 |
| 44305.552083333336 | 6.9 |
| 44305.5625 | 6.87 |
| 44305.572916666664 | 6.85 |
| 44305.583333333336 | 6.85 |
| 44305.59375 | 6.83 |
| 44305.604166666664 | 6.81 |
| 44305.614583333336 | 6.8 |
| 44305.625 | 6.85 |
| 44305.635416666664 | 6.94 |
| 44305.645833333336 | 6.96 |
| 44305.65625 | 6.94 |
| 44305.666666666664 | 6.93 |
| 44305.677083333336 | 6.92 |
| 44305.6875 | 6.95 |
| 44305.697916666664 | 6.96 |
| 44305.708333333336 | 6.97 |
| 44305.71875 | 6.97 |
| 44305.729166666664 | 6.98 |
| 44305.739583333336 | 6.97 |
| 44305.75 | 6.89 |
| 44305.760416666664 | 6.99 |
| 44305.770833333336 | 7.02 |
| 44305.78125 | 7 |
| 44305.791666666664 | 7.03 |
| 44305.802083333336 | 7.08 |
| 44305.8125 | 7.1 |
| 44305.822916666664 | 7.09 |
| 44305.833333333336 | 7.12 |
| 44305.84375 | 7.16 |
| 44305.854166666664 | 7.22 |
| 44305.864583333336 | 7.24 |
| 44305.875 | 7.3 |
| 44305.885416666664 | 7.4 |
| 44305.895833333336 | 7.53 |
| 44305.90625 | 7.58 |
| 44305.916666666664 | 7.58 |
| 44305.927083333336 | 7.62 |
| 44305.9375 | 7.64 |
| 44305.947916666664 | 7.63 |
| 44305.958333333336 | 7.62 |
| 44305.96875 | 7.58 |
| 44305.979166666664 | 7.53 |
| 44305.989583333336 | 7.48 |
| 44306.0 | 7.36 |
| 44306.010416666664 | 7.45 |
| 44306.020833333336 | 7.5 |
| 44306.03125 | 7.47 |
| 44306.041666666664 | 7.45 |
| 44306.052083333336 | 7.39 |
| 44306.0625 | 7.36 |
| 44306.072916666664 | 7.35 |
| 44306.083333333336 | 7.32 |
| 44306.09375 | 7.28 |
| 44306.104166666664 | 7.23 |
| 44306.114583333336 | 7.18 |
| 44306.125 | 7.14 |
| 44306.135416666664 | 7.09 |
| 44306.145833333336 | 7.06 |
| 44306.15625 | 7.04 |
| 44306.166666666664 | 7.04 |
| 44306.177083333336 | 7.01 |
| 44306.1875 | 6.98 |
| 44306.197916666664 | 6.95 |
| 44306.208333333336 | 6.93 |
| 44306.21875 | 6.9 |
| 44306.229166666664 | 6.87 |
| 44306.239583333336 | 6.84 |
| 44306.25 | 6.82 |
| 44306.260416666664 | 6.79 |
| 44306.270833333336 | 6.77 |
| 44306.28125 | 6.74 |
| 44306.291666666664 | 6.72 |
| 44306.302083333336 | 6.71 |
| 44306.3125 | 6.68 |
| 44306.322916666664 | 6.69 |
| 44306.333333333336 | 6.71 |
| 44306.34375 | 6.66 |
| 44306.354166666664 | 6.58 |
| 44306.364583333336 | 6.46 |
| 44306.375 | 6.44 |
| 44306.385416666664 | 6.39 |
| 44306.395833333336 | 6.23 |
| 44306.40625 | 6.17 |
| 44306.416666666664 | 6.14 |
| 44306.427083333336 | 6.03 |
| 44306.4375 | 6.02 |
| 44306.447916666664 | 6.07 |
| 44306.458333333336 | 6.5 |
| 44306.46875 | 6.53 |
| 44306.479166666664 | 6.54 |
| 44306.489583333336 | 6.56 |
| 44306.5 | 6.57 |
| 44306.510416666664 | 6.57 |
| 44306.520833333336 | 6.58 |
| 44306.53125 | 6.64 |
| 44306.541666666664 | 6.65 |
| 44306.552083333336 | 6.65 |
| 44306.5625 | 6.59 |
| 44306.572916666664 | 6.51 |
| 44306.583333333336 | 6.52 |
| 44306.59375 | 6.53 |
| 44306.604166666664 | 6.5 |
| 44306.614583333336 | 6.53 |
| 44306.625 | 6.57 |
| 44306.635416666664 | 6.62 |
| 44306.645833333336 | 6.68 |
| 44306.65625 | 6.7 |
| 44306.666666666664 | 6.79 |
| 44306.677083333336 | 6.93 |
| 44306.6875 | 7.14 |
| 44306.697916666664 | 7.24 |
| 44306.708333333336 | 7.26 |
| 44306.71875 | 7.29 |
| 44306.729166666664 | 7.31 |
| 44306.739583333336 | 7.35 |
| 44306.75 | 7.39 |
| 44306.760416666664 | 7.41 |
| 44306.770833333336 | 7.45 |
| 44306.78125 | 7.45 |
| 44306.791666666664 | 7.47 |
| 44306.802083333336 | 7.45 |
| 44306.8125 | 7.52 |
| 44306.822916666664 | 7.55 |
| 44306.833333333336 | 7.53 |
| 44306.84375 | 7.49 |
| 44306.854166666664 | 7.5 |
| 44306.864583333336 | 7.51 |
| 44306.875 | 7.86 |
| 44306.885416666664 | 7.85 |
| 44306.895833333336 | 7.86 |
| 44306.90625 | 7.87 |
| 44306.916666666664 | 7.78 |
| 44306.927083333336 | 7.78 |
| 44306.9375 | 7.74 |
| 44306.947916666664 | 7.7 |
| 44306.958333333336 | 7.68 |
| 44306.96875 | 7.78 |
| 44306.979166666664 | 7.88 |
| 44306.989583333336 | 7.92 |
| 44307.0 | 7.92 |
| 44307.010416666664 | 7.91 |
| 44307.020833333336 | 7.9 |
| 44307.03125 | 7.89 |
| 44307.041666666664 | 7.87 |
| 44307.052083333336 | 7.83 |
| 44307.0625 | 7.78 |
| 44307.072916666664 | 7.76 |
| 44307.083333333336 | 7.59 |
| 44307.09375 | 7.48 |
| 44307.104166666664 | 7.56 |
| 44307.114583333336 | 7.46 |
| 44307.125 | 7.37 |
| 44307.135416666664 | 7.35 |
| 44307.145833333336 | 7.35 |
| 44307.15625 | 7.39 |
| 44307.166666666664 | 7.35 |
| 44307.177083333336 | 7.32 |
| 44307.1875 | 7.32 |
| 44307.197916666664 | 7.34 |
| 44307.208333333336 | 7.36 |
| 44307.21875 | 7.36 |
| 44307.229166666664 | 7.36 |
| 44307.239583333336 | 7.35 |
| 44307.25 | 7.33 |
| 44307.260416666664 | 7.33 |
| 44307.270833333336 | 7.32 |
| 44307.28125 | 7.28 |
| 44307.291666666664 | 7.28 |
| 44307.302083333336 | 7.25 |
| 44307.3125 | 7.2 |
| 44307.322916666664 | 7.1 |
| 44307.333333333336 | 6.94 |
| 44307.34375 | 7.11 |
| 44307.354166666664 | 7.2 |
| 44307.364583333336 | 7.1 |
| 44307.375 | 7.03 |
| 44307.385416666664 | 6.91 |
| 44307.395833333336 | 6.89 |
| 44307.40625 | 6.76 |
| 44307.416666666664 | 6.8 |
| 44307.427083333336 | 6.58 |
| 44307.4375 | 6.51 |
| 44307.447916666664 | 6.49 |
| 44307.458333333336 | 6.44 |
| 44307.46875 | 6.76 |
| 44307.479166666664 | 6.86 |
| 44307.489583333336 | 6.84 |
| 44307.5 | 6.8 |
| 44307.510416666664 | 6.78 |
| 44307.520833333336 | 6.8 |
| 44307.53125 | 6.8 |
| 44307.541666666664 | 6.84 |
| 44307.552083333336 | 6.88 |
| 44307.5625 | 6.95 |
| 44307.572916666664 | 6.97 |
| 44307.583333333336 | 6.99 |
| 44307.59375 | 6.96 |
| 44307.604166666664 | 6.87 |
| 44307.614583333336 | 6.86 |
| 44307.625 | 6.83 |
| 44307.635416666664 | 6.91 |
| 44307.645833333336 | 6.92 |
| 44307.65625 | 6.95 |
| 44307.666666666664 | 7.03 |
| 44307.677083333336 | 7.23 |
| 44307.6875 | 7.33 |
| 44307.697916666664 | 7.39 |
| 44307.708333333336 | 7.42 |
| 44307.71875 | 7.48 |
| 44307.729166666664 | 7.52 |
| 44307.739583333336 | 7.53 |
| 44307.75 | 7.54 |
| 44307.760416666664 | 7.55 |
| 44307.770833333336 | 7.56 |
| 44307.78125 | 7.6 |
| 44307.791666666664 | 7.57 |
| 44307.802083333336 | 7.58 |
| 44307.8125 | 7.52 |
| 44307.822916666664 | 7.52 |
| 44307.833333333336 | 7.47 |
| 44307.84375 | 7.48 |
| 44307.854166666664 | 7.51 |
| 44307.864583333336 | 7.5 |
| 44307.875 | 7.48 |
| 44307.885416666664 | 7.49 |
| 44307.895833333336 | 7.47 |
| 44307.90625 | 7.46 |
| 44307.916666666664 | 7.46 |
| 44307.927083333336 | 7.46 |
| 44307.9375 | 7.45 |
| 44307.947916666664 | 7.44 |
| 44307.958333333336 | 7.46 |
| 44307.96875 | 7.62 |
| 44307.979166666664 | 7.66 |
| 44307.989583333336 | 7.64 |
| 44308.0 | 7.6 |
| 44308.010416666664 | 7.57 |
| 44308.020833333336 | 7.56 |
| 44308.03125 | 7.56 |
| 44308.041666666664 | 7.56 |
| 44308.052083333336 | 7.57 |
| 44308.0625 | 7.53 |
| 44308.072916666664 | 7.56 |
| 44308.083333333336 | 7.53 |
| 44308.09375 | 7.51 |
| 44308.104166666664 | 7.48 |
| 44308.114583333336 | 7.47 |
| 44308.125 | 7.46 |
| 44308.135416666664 | 7.36 |
| 44308.145833333336 | 7.3 |
| 44308.15625 | 7.22 |
| 44308.166666666664 | 7.25 |
| 44308.177083333336 | 7.29 |
| 44308.1875 | 7.34 |
| 44308.197916666664 | 7.36 |
| 44308.208333333336 | 7.36 |
| 44308.21875 | 7.33 |
| 44308.229166666664 | 7.31 |
| 44308.239583333336 | 7.28 |
| 44308.25 | 7.31 |
| 44308.260416666664 | 7.35 |
| 44308.270833333336 | 7.32 |
| 44308.28125 | 7.36 |
| 44308.291666666664 | 7.39 |
| 44308.302083333336 | 7.41 |
| 44308.3125 | 7.42 |
| 44308.322916666664 | 7.44 |
| 44308.333333333336 | 7.45 |
| 44308.34375 | 7.47 |
| 44308.354166666664 | 7.46 |
| 44308.364583333336 | 7.46 |
| 44308.375 | 7.4 |
| 44308.385416666664 | 7.42 |
| 44308.395833333336 | 7.36 |
| 44308.40625 | 7.33 |
| 44308.416666666664 | 7.42 |
| 44308.427083333336 | 7.34 |
| 44308.4375 | 7.38 |
| 44308.447916666664 | 7.42 |
| 44308.458333333336 | 7.38 |
| 44308.46875 | 7.4 |
| 44308.479166666664 | 7.42 |
| 44308.489583333336 | 7.47 |
| 44308.5 | 7.53 |
| 44308.510416666664 | 7.52 |
| 44308.520833333336 | 7.53 |
| 44308.53125 | 7.56 |
| 44308.541666666664 | 7.56 |
| 44308.552083333336 | 7.58 |
| 44308.5625 | 7.6 |
| 44308.572916666664 | 7.63 |
| 44308.583333333336 | 7.67 |
| 44308.59375 | 7.72 |
| 44308.604166666664 | 7.82 |
| 44308.614583333336 | 7.89 |
| 44308.625 | 7.97 |
| 44308.635416666664 | 7.99 |
| 44308.645833333336 | 8.08 |
| 44308.65625 | 8.11 |
| 44308.666666666664 | 8.01 |
| 44308.677083333336 | 7.95 |
| 44308.6875 | 7.95 |
| 44308.697916666664 | 7.86 |
| 44308.708333333336 | 7.9 |
| 44308.71875 | 8.04 |
| 44308.729166666664 | 8.07 |
| 44308.739583333336 | 8.1 |
| 44308.75 | 8.16 |
| 44308.760416666664 | 8.23 |
| 44308.770833333336 | 8.27 |
| 44308.78125 | 8.3 |
| 44308.791666666664 | 8.29 |
| 44308.802083333336 | 8.3 |
| 44308.8125 | 8.26 |
| 44308.822916666664 | 8.21 |
| 44308.833333333336 | 8.16 |
| 44308.84375 | 8.09 |
| 44308.854166666664 | 8.08 |
| 44308.864583333336 | 8.05 |
| 44308.875 | 8.06 |
| 44308.885416666664 | 8.07 |
| 44308.895833333336 | 8.05 |
| 44308.90625 | 8.17 |
| 44308.916666666664 | 8.16 |
| 44308.927083333336 | 8.13 |
| 44308.9375 | 8.1 |
| 44308.947916666664 | 8.1 |
| 44308.958333333336 | 8.09 |
| 44308.96875 | 8.07 |
| 44308.979166666664 | 8.02 |
| 44308.989583333336 | 8.08 |
| 44309.0 | 8.14 |
| 44309.010416666664 | 8.31 |
| 44309.020833333336 | 8.35 |
| 44309.03125 | 8.46 |
| 44309.041666666664 | 8.51 |
| 44309.052083333336 | 8.46 |
| 44309.0625 | 8.48 |
| 44309.072916666664 | 8.45 |
| 44309.083333333336 | 8.51 |
| 44309.09375 | 8.51 |
| 44309.104166666664 | 8.44 |
| 44309.114583333336 | 8.45 |
| 44309.125 | 8.41 |
| 44309.135416666664 | 8.4 |
| 44309.145833333336 | 8.31 |
| 44309.15625 | 8.16 |
| 44309.166666666664 | 8.32 |
| 44309.177083333336 | 8.29 |
| 44309.1875 | 8.29 |
| 44309.197916666664 | 8.25 |
| 44309.208333333336 | 8.13 |
| 44309.21875 | 8.1 |
| 44309.229166666664 | 8.03 |
| 44309.239583333336 | 8 |
| 44309.25 | 7.9 |
| 44309.260416666664 | 7.87 |
| 44309.270833333336 | 7.75 |
| 44309.28125 | 7.7 |
| 44309.291666666664 | 7.59 |
| 44309.302083333336 | 7.53 |
| 44309.3125 | 7.4 |
| 44309.322916666664 | 7.32 |
| 44309.333333333336 | 7.25 |
| 44309.34375 | 7.22 |
| 44309.354166666664 | 7.19 |
| 44309.364583333336 | 7.16 |
| 44309.375 | 7.17 |
| 44309.385416666664 | 7.17 |
| 44309.395833333336 | 7.2 |
| 44309.40625 | 7.2 |
| 44309.416666666664 | 7.08 |
| 44309.427083333336 | 7.22 |
| 44309.4375 | 7.27 |
| 44309.447916666664 | 7.26 |
| 44309.458333333336 | 7.18 |
| 44309.46875 | 7.14 |
| 44309.479166666664 | 7.09 |
| 44309.489583333336 | 7.07 |
| 44309.5 | 7.09 |
| 44309.510416666664 | 7.1 |
| 44309.520833333336 | 7.3 |
| 44309.53125 | 7.42 |
| 44309.541666666664 | 7.58 |
| 44309.552083333336 | 7.66 |
| 44309.5625 | 7.69 |
| 44309.572916666664 | 7.77 |
| 44309.583333333336 | 7.79 |
| 44309.59375 | 7.89 |
| 44309.604166666664 | 7.9 |
| 44309.614583333336 | 7.86 |
| 44309.625 | 7.81 |
| 44309.635416666664 | 7.87 |
| 44309.645833333336 | 7.88 |
| 44309.65625 | 7.94 |
| 44309.666666666664 | 7.98 |
| 44309.677083333336 | 8.06 |
| 44309.6875 | 8.04 |
| 44309.697916666664 | 7.98 |
| 44309.708333333336 | 8.05 |
| 44309.71875 | 8.04 |
| 44309.729166666664 | 8.02 |
| 44309.739583333336 | 8 |
| 44309.75 | 8 |
| 44309.760416666664 | 7.98 |
| 44309.770833333336 | 7.97 |
| 44309.78125 | 8.01 |
| 44309.791666666664 | 8.07 |
| 44309.802083333336 | 8.19 |
| 44309.8125 | 8.22 |
| 44309.822916666664 | 8.17 |
| 44309.833333333336 | 8.08 |
| 44309.84375 | 7.94 |
| 44309.854166666664 | 7.8 |
| 44309.864583333336 | 7.74 |
| 44309.875 | 7.8 |
| 44309.885416666664 | 7.81 |
| 44309.895833333336 | 7.81 |
| 44309.90625 | 7.81 |
| 44309.916666666664 | 7.8 |
| 44309.927083333336 | 7.79 |
| 44309.9375 | 7.81 |
| 44309.947916666664 | 7.81 |
| 44309.958333333336 | 7.78 |
| 44309.96875 | 7.81 |
| 44309.979166666664 | 7.81 |
| 44309.989583333336 | 7.72 |
| 44310.0 | 7.72 |
| 44310.010416666664 | 7.7 |
| 44310.020833333336 | 7.6 |
| 44310.03125 | 7.63 |
| 44310.041666666664 | 7.6 |
| 44310.052083333336 | 7.73 |
| 44310.0625 | 7.96 |
| 44310.072916666664 | 7.97 |
| 44310.083333333336 | 8.05 |
| 44310.09375 | 8.05 |
| 44310.104166666664 | 8.05 |
| 44310.114583333336 | 8.04 |
| 44310.125 | 8.06 |
| 44310.135416666664 | 8.07 |
| 44310.145833333336 | 7.99 |
| 44310.15625 | 8 |
| 44310.166666666664 | 7.99 |
| 44310.177083333336 | 7.94 |
| 44310.1875 | 7.94 |
| 44310.197916666664 | 7.95 |
| 44310.208333333336 | 7.83 |
| 44310.21875 | 7.75 |
| 44310.229166666664 | 7.82 |
| 44310.239583333336 | 7.82 |
| 44310.25 | 7.8 |
| 44310.260416666664 | 7.75 |
| 44310.270833333336 | 7.7 |
| 44310.28125 | 7.65 |
| 44310.291666666664 | 7.62 |
| 44310.302083333336 | 7.56 |
| 44310.3125 | 7.46 |
| 44310.322916666664 | 7.27 |
| 44310.333333333336 | 7.05 |
| 44310.34375 | 6.9 |
| 44310.354166666664 | 6.8 |
| 44310.364583333336 | 6.75 |
| 44310.375 | 6.76 |
| 44310.385416666664 | 6.8 |
| 44310.395833333336 | 6.87 |
| 44310.40625 | 6.97 |
| 44310.416666666664 | 7.04 |
| 44310.427083333336 | 7.07 |
| 44310.4375 | 7.08 |
| 44310.447916666664 | 7.1 |
| 44310.458333333336 | 7.09 |
| 44310.46875 | 7.03 |
| 44310.479166666664 | 7.05 |
| 44310.489583333336 | 7.02 |
| 44310.5 | 6.98 |
| 44310.510416666664 | 6.98 |
| 44310.520833333336 | 6.94 |
| 44310.53125 | 6.96 |
| 44310.541666666664 | 7 |
| 44310.552083333336 | 7.02 |
| 44310.5625 | 7.01 |
| 44310.572916666664 | 7.11 |
| 44310.583333333336 | 7.24 |
| 44310.59375 | 7.41 |
| 44310.604166666664 | 7.48 |
| 44310.614583333336 | 7.57 |
| 44310.625 | 7.66 |
| 44310.635416666664 | 7.75 |
| 44310.645833333336 | 7.83 |
| 44310.65625 | 7.86 |
| 44310.666666666664 | 7.91 |
| 44310.677083333336 | 7.95 |
| 44310.6875 | 7.98 |
| 44310.697916666664 | 8.01 |
| 44310.708333333336 | 8.05 |
| 44310.71875 | 7.97 |
| 44310.729166666664 | 7.93 |
| 44310.739583333336 | 7.95 |
| 44310.75 | 7.95 |
| 44310.760416666664 | 7.94 |
| 44310.770833333336 | 7.97 |
| 44310.78125 | 8.1 |
| 44310.791666666664 | 8.19 |
| 44310.802083333336 | 8.22 |
| 44310.8125 | 8.19 |
| 44310.822916666664 | 8.15 |
| 44310.833333333336 | 8 |
| 44310.84375 | 7.86 |
| 44310.854166666664 | 7.71 |
| 44310.864583333336 | 7.59 |
| 44310.875 | 7.58 |
| 44310.885416666664 | 7.62 |
| 44310.895833333336 | 7.65 |
| 44310.90625 | 7.61 |
| 44310.916666666664 | 7.58 |
| 44310.927083333336 | 7.59 |
| 44310.9375 | 7.6 |
| 44310.947916666664 | 7.62 |
| 44310.958333333336 | 7.6 |
| 44310.96875 | 7.59 |
| 44310.979166666664 | 7.59 |
| 44310.989583333336 | 7.55 |
| 44311.0 | 7.52 |
| 44311.010416666664 | 7.5 |
| 44311.020833333336 | 7.39 |
| 44311.03125 | 7.31 |
| 44311.041666666664 | 7.21 |
| 44311.052083333336 | 7.16 |
| 44311.0625 | 7.04 |
| 44311.072916666664 | 7.08 |
| 44311.083333333336 | 6.94 |
| 44311.09375 | 6.88 |
| 44311.104166666664 | 6.89 |
| 44311.114583333336 | 7.08 |
| 44311.125 | 7.31 |
| 44311.135416666664 | 7.38 |
| 44311.145833333336 | 7.37 |
| 44311.15625 | 7.42 |
| 44311.166666666664 | 7.43 |
| 44311.177083333336 | 7.41 |
| 44311.1875 | 7.32 |
| 44311.197916666664 | 7.24 |
| 44311.208333333336 | 7.37 |
| 44311.21875 | 7.37 |
| 44311.229166666664 | 7.44 |
| 44311.239583333336 | 7.43 |
| 44311.25 | 7.35 |
| 44311.260416666664 | 7.37 |
| 44311.270833333336 | 7.35 |
| 44311.28125 | 7.33 |
| 44311.291666666664 | 7.32 |
| 44311.302083333336 | 7.31 |
| 44311.3125 | 7.29 |
| 44311.322916666664 | 7.29 |
| 44311.333333333336 | 7.29 |
| 44311.34375 | 7.29 |
| 44311.354166666664 | 7.3 |
| 44311.364583333336 | 7.31 |
| 44311.375 | 7.33 |
| 44311.385416666664 | 7.35 |
| 44311.395833333336 | 7.36 |
| 44311.40625 | 7.39 |
| 44311.416666666664 | 7.41 |
| 44311.427083333336 | 7.43 |
| 44311.4375 | 7.44 |
| 44311.447916666664 | 7.44 |
| 44311.458333333336 | 7.43 |
| 44311.46875 | 7.42 |
| 44311.479166666664 | 7.42 |
| 44311.489583333336 | 7.42 |
| 44311.5 | 7.41 |
| 44311.510416666664 | 7.38 |
| 44311.520833333336 | 7.39 |
| 44311.53125 | 7.4 |
| 44311.541666666664 | 7.4 |
| 44311.552083333336 | 7.39 |
| 44311.5625 | 7.38 |
| 44311.572916666664 | 7.4 |
| 44311.583333333336 | 7.4 |
| 44311.59375 | 7.36 |
| 44311.604166666664 | 7.35 |
| 44311.614583333336 | 7.32 |
| 44311.625 | 7.31 |
| 44311.635416666664 | 7.31 |
| 44311.645833333336 | 7.32 |
| 44311.65625 | 7.36 |
| 44311.666666666664 | 7.49 |
| 44311.677083333336 | 7.56 |
| 44311.6875 | 7.62 |
| 44311.697916666664 | 7.66 |
| 44311.708333333336 | 7.72 |
| 44311.71875 | 7.77 |
| 44311.729166666664 | 7.77 |
| 44311.739583333336 | 7.84 |
| 44311.75 | 7.86 |
| 44311.760416666664 | 7.83 |
| 44311.770833333336 | 7.8 |
| 44311.78125 | 7.76 |
| 44311.791666666664 | 7.73 |
| 44311.802083333336 | 7.74 |
| 44311.8125 | 7.78 |
| 44311.822916666664 | 7.82 |
| 44311.833333333336 | 7.88 |
| 44311.84375 | 7.96 |
| 44311.854166666664 | 7.92 |
| 44311.864583333336 | 7.83 |
| 44311.875 | 7.77 |
| 44311.885416666664 | 7.75 |
| 44311.895833333336 | 7.71 |
| 44311.90625 | 7.76 |
| 44311.916666666664 | 7.78 |
| 44311.927083333336 | 7.77 |
| 44311.9375 | 7.78 |
| 44311.947916666664 | 7.8 |
| 44311.958333333336 | 7.8 |
| 44311.96875 | 7.81 |
| 44311.979166666664 | 7.79 |
| 44311.989583333336 | 7.79 |
| 44312.0 | 7.77 |
| 44312.010416666664 | 7.75 |
| 44312.020833333336 | 7.74 |
| 44312.03125 | 7.72 |
| 44312.041666666664 | 7.69 |
| 44312.052083333336 | 7.71 |
| 44312.0625 | 7.67 |
| 44312.072916666664 | 7.61 |
| 44312.083333333336 | 7.56 |
| 44312.09375 | 7.53 |
| 44312.104166666664 | 7.47 |
| 44312.114583333336 | 7.43 |
| 44312.125 | 7.28 |
| 44312.135416666664 | 7.16 |
| 44312.145833333336 | 7 |
| 44312.15625 | 6.83 |
| 44312.166666666664 | 6.65 |
| 44312.177083333336 | 6.54 |
| 44312.1875 | 6.58 |
| 44312.197916666664 | 6.88 |
| 44312.208333333336 | 7.08 |
| 44312.21875 | 7.03 |
| 44312.229166666664 | 7.04 |
| 44312.239583333336 | 6.99 |
| 44312.25 | 6.91 |
| 44312.260416666664 | 6.83 |
| 44312.270833333336 | 6.75 |
| 44312.28125 | 6.69 |
| 44312.291666666664 | 6.67 |
| 44312.302083333336 | 6.68 |
| 44312.3125 | 6.68 |
| 44312.322916666664 | 6.66 |
| 44312.333333333336 | 6.7 |
| 44312.34375 | 6.8 |
| 44312.354166666664 | 6.87 |
| 44312.364583333336 | 6.85 |
| 44312.375 | 6.85 |
| 44312.385416666664 | 6.88 |
| 44312.395833333336 | 6.91 |
| 44312.40625 | 6.95 |
| 44312.416666666664 | 7.02 |
| 44312.427083333336 | 7.04 |
| 44312.4375 | 7.08 |
| 44312.447916666664 | 7.14 |
| 44312.458333333336 | 7.2 |
| 44312.46875 | 7.25 |
| 44312.479166666664 | 7.29 |
| 44312.489583333336 | 7.32 |
| 44312.5 | 7.36 |
| 44312.510416666664 | 7.36 |
| 44312.520833333336 | 7.35 |
| 44312.53125 | 7.35 |
| 44312.541666666664 | 7.35 |
| 44312.552083333336 | 7.37 |
| 44312.5625 | 7.4 |
| 44312.572916666664 | 7.45 |
| 44312.583333333336 | 7.49 |
| 44312.59375 | 7.55 |
| 44312.604166666664 | 7.63 |
| 44312.614583333336 | 7.65 |
| 44312.625 | 7.76 |
| 44312.635416666664 | 7.8 |
| 44312.645833333336 | 7.82 |
| 44312.65625 | 7.91 |
| 44312.666666666664 | 7.8 |
| 44312.677083333336 | 7.92 |
| 44312.6875 | 8 |
| 44312.697916666664 | 8.08 |
| 44312.708333333336 | 8.04 |
| 44312.71875 | 8.12 |
| 44312.729166666664 | 8.12 |
| 44312.739583333336 | 8.12 |
| 44312.75 | 8.17 |
| 44312.760416666664 | 8.22 |
| 44312.770833333336 | 8.28 |
| 44312.78125 | 8.26 |
| 44312.791666666664 | 8.32 |
| 44312.802083333336 | 8.28 |
| 44312.8125 | 8.26 |
| 44312.822916666664 | 8.15 |
| 44312.833333333336 | 8.14 |
| 44312.84375 | 8.17 |
| 44312.854166666664 | 8.25 |
| 44312.864583333336 | 8.31 |
| 44312.875 | 8.36 |
| 44312.885416666664 | 8.37 |
| 44312.895833333336 | 8.31 |
| 44312.90625 | 8.17 |
| 44312.916666666664 | 7.97 |
| 44312.927083333336 | 7.88 |
| 44312.9375 | 7.9 |
| 44312.947916666664 | 7.87 |
| 44312.958333333336 | 7.91 |
| 44312.96875 | 7.9 |
| 44312.979166666664 | 7.87 |
| 44312.989583333336 | 7.86 |
| 44313.0 | 7.84 |
| 44313.010416666664 | 7.83 |
| 44313.020833333336 | 7.85 |
| 44313.03125 | 7.87 |
| 44313.041666666664 | 7.89 |
| 44313.052083333336 | 7.9 |
| 44313.0625 | 7.89 |
| 44313.072916666664 | 7.8 |
| 44313.083333333336 | 7.81 |
| 44313.09375 | 7.83 |
| 44313.104166666664 | 7.71 |
| 44313.114583333336 | 7.63 |
| 44313.125 | 7.56 |
| 44313.135416666664 | 7.43 |
| 44313.145833333336 | 7.24 |
| 44313.15625 | 7.11 |
| 44313.166666666664 | 7 |
| 44313.177083333336 | 6.82 |
| 44313.1875 | 6.64 |
| 44313.197916666664 | 6.61 |
| 44313.208333333336 | 6.71 |
| 44313.21875 | 6.88 |
| 44313.229166666664 | 7.06 |
| 44313.239583333336 | 7.08 |
| 44313.25 | 7.1 |
| 44313.260416666664 | 7.06 |
| 44313.270833333336 | 6.99 |
| 44313.28125 | 6.9 |
| 44313.291666666664 | 6.81 |
| 44313.302083333336 | 6.73 |
| 44313.3125 | 6.69 |
| 44313.322916666664 | 6.66 |
| 44313.333333333336 | 6.64 |
| 44313.34375 | 6.64 |
| 44313.354166666664 | 6.62 |
| 44313.364583333336 | 6.64 |
| 44313.375 | 6.73 |
| 44313.385416666664 | 6.82 |
| 44313.395833333336 | 6.85 |
| 44313.40625 | 6.87 |
| 44313.416666666664 | 6.85 |
| 44313.427083333336 | 6.81 |
| 44313.4375 | 6.83 |
| 44313.447916666664 | 6.87 |
| 44313.458333333336 | 6.91 |
| 44313.46875 | 6.94 |
| 44313.479166666664 | 7.02 |
| 44313.489583333336 | 7.06 |
| 44313.5 | 7.12 |
| 44313.510416666664 | 7.17 |
| 44313.520833333336 | 7.2 |
| 44313.53125 | 7.21 |
| 44313.541666666664 | 7.19 |
| 44313.552083333336 | 7.15 |
| 44313.5625 | 7.14 |
| 44313.572916666664 | 7.18 |
| 44313.583333333336 | 7.12 |
| 44313.59375 | 7.18 |
| 44313.604166666664 | 7.31 |
| 44313.614583333336 | 7.54 |
| 44313.625 | 7.69 |
| 44313.635416666664 | 7.81 |
| 44313.645833333336 | 7.89 |
| 44313.65625 | 7.86 |
| 44313.666666666664 | 8 |
| 44313.677083333336 | 8.03 |
| 44313.6875 | 7.96 |
| 44313.697916666664 | 7.94 |
| 44313.708333333336 | 7.91 |
| 44313.71875 | 7.94 |
| 44313.729166666664 | 7.95 |
| 44313.739583333336 | 7.95 |
| 44313.75 | 7.89 |
| 44313.760416666664 | 7.86 |
| 44313.770833333336 | 7.88 |
| 44313.78125 | 7.92 |
| 44313.791666666664 | 7.98 |
| 44313.802083333336 | 8 |
| 44313.8125 | 8.05 |
| 44313.822916666664 | 8.09 |
| 44313.833333333336 | 7.95 |
| 44313.84375 | 7.93 |
| 44313.854166666664 | 7.83 |
| 44313.864583333336 | 7.77 |
| 44313.875 | 7.8 |
| 44313.885416666664 | 7.76 |
| 44313.895833333336 | 7.86 |
| 44313.90625 | 7.87 |
| 44313.916666666664 | 7.82 |
| 44313.927083333336 | 7.7 |
| 44313.9375 | 7.58 |
| 44313.947916666664 | 7.48 |
| 44313.958333333336 | 7.47 |
| 44313.96875 | 7.44 |
| 44313.979166666664 | 7.44 |
| 44313.989583333336 | 7.45 |
| 44314.0 | 7.45 |
| 44314.010416666664 | 7.49 |
| 44314.020833333336 | 7.51 |
| 44314.03125 | 7.47 |
| 44314.041666666664 | 7.45 |
| 44314.052083333336 | 7.42 |
| 44314.0625 | 7.39 |
| 44314.072916666664 | 7.41 |
| 44314.083333333336 | 7.44 |
| 44314.09375 | 7.43 |
| 44314.104166666664 | 7.41 |
| 44314.114583333336 | 7.37 |
| 44314.125 | 7.37 |
| 44314.135416666664 | 7.2 |
| 44314.145833333336 | 7.13 |
| 44314.15625 | 7.05 |
| 44314.166666666664 | 6.93 |
| 44314.177083333336 | 6.8 |
| 44314.1875 | 6.55 |
| 44314.197916666664 | 6.3 |
| 44314.208333333336 | 6.14 |
| 44314.21875 | 5.97 |
| 44314.229166666664 | 6.13 |
| 44314.239583333336 | 6.2 |
| 44314.25 | 6.26 |
| 44314.260416666664 | 6.44 |
| 44314.270833333336 | 6.48 |
| 44314.28125 | 6.43 |
| 44314.291666666664 | 6.44 |
| 44314.302083333336 | 6.38 |
| 44314.3125 | 6.29 |
| 44314.322916666664 | 6.2 |
| 44314.333333333336 | 6.11 |
| 44314.34375 | 6.09 |
| 44314.354166666664 | 6.08 |
| 44314.364583333336 | 6.04 |
| 44314.375 | 6.05 |
| 44314.385416666664 | 6 |
| 44314.395833333336 | 5.98 |
| 44314.40625 | 6.06 |
| 44314.416666666664 | 6.25 |
| 44314.427083333336 | 6.38 |
| 44314.4375 | 6.42 |
| 44314.447916666664 | 6.46 |
| 44314.458333333336 | 6.51 |
| 44314.46875 | 6.6 |
| 44314.479166666664 | 6.67 |
| 44314.489583333336 | 6.74 |
| 44314.5 | 6.78 |
| 44314.510416666664 | 6.83 |
| 44314.520833333336 | 6.85 |
| 44314.53125 | 6.9 |
| 44314.541666666664 | 6.91 |
| 44314.552083333336 | 6.91 |
| 44314.5625 | 6.91 |
| 44314.572916666664 | 6.89 |
| 44314.583333333336 | 6.87 |
| 44314.59375 | 6.86 |
| 44314.604166666664 | 6.84 |
| 44314.614583333336 | 6.84 |
| 44314.625 | 6.84 |
| 44314.635416666664 | 6.93 |
| 44314.645833333336 | 7.06 |
| 44314.65625 | 7.17 |
| 44314.666666666664 | 7.25 |
| 44314.677083333336 | 7.27 |
| 44314.6875 | 7.27 |
| 44314.697916666664 | 7.41 |
| 44314.708333333336 | 7.5 |
| 44314.71875 | 7.47 |
| 44314.729166666664 | 7.52 |
| 44314.739583333336 | 7.63 |
| 44314.75 | 7.7 |
| 44314.760416666664 | 7.67 |
| 44314.770833333336 | 7.71 |
| 44314.78125 | 7.64 |
| 44314.791666666664 | 7.56 |
| 44314.802083333336 | 7.55 |
| 44314.8125 | 7.57 |
| 44314.822916666664 | 7.6 |
| 44314.833333333336 | 7.65 |
| 44314.84375 | 7.64 |
| 44314.854166666664 | 7.69 |
| 44314.864583333336 | 7.54 |
| 44314.875 | 7.48 |
| 44314.885416666664 | 7.43 |
| 44314.895833333336 | 7.34 |
| 44314.90625 | 7.36 |
| 44314.916666666664 | 7.48 |
| 44314.927083333336 | 7.55 |
| 44314.9375 | 7.52 |
| 44314.947916666664 | 7.39 |
| 44314.958333333336 | 7.2 |
| 44314.96875 | 7.08 |
| 44314.979166666664 | 7.01 |
| 44314.989583333336 | 6.98 |
| 44315.0 | 6.99 |
| 44315.010416666664 | 6.98 |
| 44315.020833333336 | 6.97 |
| 44315.03125 | 7.01 |
| 44315.041666666664 | 7.04 |
| 44315.052083333336 | 7.06 |
| 44315.0625 | 7.05 |
| 44315.072916666664 | 7.03 |
| 44315.083333333336 | 7.01 |
| 44315.09375 | 7 |
| 44315.104166666664 | 7.02 |
| 44315.114583333336 | 7.01 |
| 44315.125 | 7.01 |
| 44315.135416666664 | 6.99 |
| 44315.145833333336 | 6.93 |
| 44315.15625 | 6.95 |
| 44315.166666666664 | 6.89 |
| 44315.177083333336 | 6.75 |
| 44315.1875 | 6.63 |
| 44315.197916666664 | 6.53 |
| 44315.208333333336 | 6.43 |
| 44315.21875 | 6.22 |
| 44315.229166666664 | 6 |
| 44315.239583333336 | 5.85 |
| 44315.25 | 5.69 |
| 44315.260416666664 | 5.53 |
| 44315.270833333336 | 5.49 |
| 44315.28125 | 5.53 |
| 44315.291666666664 | 5.71 |
| 44315.302083333336 | 5.91 |
| 44315.3125 | 5.92 |
| 44315.322916666664 | 5.93 |
| 44315.333333333336 | 5.89 |
| 44315.34375 | 5.79 |
| 44315.354166666664 | 5.63 |
| 44315.364583333336 | 5.52 |
| 44315.375 | 5.4 |
| 44315.385416666664 | 5.38 |
| 44315.395833333336 | 5.37 |
| 44315.40625 | 5.33 |
| 44315.416666666664 | 5.29 |
| 44315.427083333336 | 5.3 |
| 44315.4375 | 5.35 |
| 44315.447916666664 | 5.44 |
| 44315.458333333336 | 5.66 |
| 44315.46875 | 5.69 |
| 44315.479166666664 | 5.76 |
| 44315.489583333336 | 5.78 |
| 44315.5 | 5.85 |
| 44315.510416666664 | 5.92 |
| 44315.520833333336 | 5.96 |
| 44315.53125 | 6.01 |
| 44315.541666666664 | 6.06 |
| 44315.552083333336 | 6.13 |
| 44315.5625 | 6.23 |
| 44315.572916666664 | 6.3 |
| 44315.583333333336 | 6.37 |
| 44315.59375 | 6.42 |
| 44315.604166666664 | 6.43 |
| 44315.614583333336 | 6.43 |
| 44315.625 | 6.42 |
| 44315.635416666664 | 6.41 |
| 44315.645833333336 | 6.4 |
| 44315.65625 | 6.36 |
| 44315.666666666664 | 6.48 |
| 44315.677083333336 | 6.54 |
| 44315.6875 | 6.63 |
| 44315.697916666664 | 7.12 |
| 44315.708333333336 | 7.17 |
| 44315.71875 | 7.15 |
| 44315.729166666664 | 7.32 |
| 44315.739583333336 | 7.39 |
| 44315.75 | 7.36 |
| 44315.760416666664 | 7.37 |
| 44315.770833333336 | 7.11 |
| 44315.78125 | 7.18 |
| 44315.791666666664 | 7.22 |
| 44315.802083333336 | 7.2 |
| 44315.8125 | 7.17 |
| 44315.822916666664 | 7.13 |
| 44315.833333333336 | 7.1 |
| 44315.84375 | 7.06 |
| 44315.854166666664 | 7.02 |
| 44315.864583333336 | 7.01 |
| 44315.875 | 7.02 |
| 44315.885416666664 | 7 |
| 44315.895833333336 | 7.03 |
| 44315.90625 | 6.89 |
| 44315.916666666664 | 6.78 |
| 44315.927083333336 | 6.69 |
| 44315.9375 | 6.71 |
| 44315.947916666664 | 6.7 |
| 44315.958333333336 | 6.64 |
| 44315.96875 | 6.63 |
| 44315.979166666664 | 6.62 |
| 44315.989583333336 | 6.59 |
| 44316.0 | 6.52 |
| 44316.010416666664 | 6.44 |
| 44316.020833333336 | 6.41 |
| 44316.03125 | 6.43 |
| 44316.041666666664 | 6.42 |
| 44316.052083333336 | 6.45 |
| 44316.0625 | 6.48 |
| 44316.072916666664 | 6.52 |
| 44316.083333333336 | 6.53 |
| 44316.09375 | 6.54 |
| 44316.104166666664 | 6.55 |
| 44316.114583333336 | 6.57 |
| 44316.125 | 6.57 |
| 44316.135416666664 | 6.61 |
| 44316.145833333336 | 6.63 |
| 44316.15625 | 6.64 |
| 44316.166666666664 | 6.63 |
| 44316.177083333336 | 6.55 |
| 44316.1875 | 6.53 |
| 44316.197916666664 | 6.55 |
| 44316.208333333336 | 6.5 |
| 44316.21875 | 6.52 |
| 44316.229166666664 | 6.3 |
| 44316.239583333336 | 6.15 |
| 44316.25 | 6.13 |
| 44316.260416666664 | 5.95 |
| 44316.270833333336 | 5.72 |
| 44316.28125 | 5.61 |
| 44316.291666666664 | 5.44 |
| 44316.302083333336 | 5.21 |
| 44316.3125 | 5.06 |
| 44316.322916666664 | 5.09 |
| 44316.333333333336 | 5.32 |
| 44316.34375 | 5.49 |
| 44316.354166666664 | 5.48 |
| 44316.364583333336 | 5.45 |
| 44316.375 | 5.42 |
| 44316.385416666664 | 5.31 |
| 44316.395833333336 | 5.23 |
| 44316.40625 | 5.09 |
| 44316.416666666664 | 5.06 |
| 44316.427083333336 | 5 |
| 44316.4375 | 4.94 |
| 44316.447916666664 | 4.91 |
| 44316.458333333336 | 4.93 |
| 44316.46875 | 4.88 |
| 44316.479166666664 | 4.89 |
| 44316.489583333336 | 4.98 |
| 44316.5 | 5.17 |
| 44316.510416666664 | 5.31 |
| 44316.520833333336 | 5.42 |
| 44316.53125 | 5.44 |
| 44316.541666666664 | 5.45 |
| 44316.552083333336 | 5.51 |
| 44316.5625 | 5.55 |
| 44316.572916666664 | 5.66 |
| 44316.583333333336 | 5.79 |
| 44316.59375 | 5.89 |
| 44316.604166666664 | 6.02 |
| 44316.614583333336 | 6.17 |
| 44316.625 | 6.28 |
| 44316.635416666664 | 6.37 |
| 44316.645833333336 | 6.46 |
| 44316.65625 | 6.53 |
| 44316.666666666664 | 6.56 |
| 44316.677083333336 | 6.59 |
| 44316.6875 | 6.57 |
| 44316.697916666664 | 6.65 |
| 44316.708333333336 | 6.61 |
| 44316.71875 | 6.71 |
| 44316.729166666664 | 6.87 |
| 44316.739583333336 | 7.09 |
| 44316.75 | 7.06 |
| 44316.760416666664 | 7.02 |
| 44316.770833333336 | 7.1 |
| 44316.78125 | 7.1 |
| 44316.791666666664 | 7.1 |
| 44316.802083333336 | 7.07 |
| 44316.8125 | 7.1 |
| 44316.822916666664 | 7.08 |
| 44316.833333333336 | 7.09 |
| 44316.84375 | 7.14 |
| 44316.854166666664 | 7.18 |
| 44316.864583333336 | 7.22 |
| 44316.875 | 7.21 |
| 44316.885416666664 | 7.22 |
| 44316.895833333336 | 7.23 |
| 44316.90625 | 7.18 |
| 44316.916666666664 | 7.18 |
| 44316.927083333336 | 7.15 |
| 44316.9375 | 7.05 |
| 44316.947916666664 | 6.99 |
| 44316.958333333336 | 6.97 |
| 44316.96875 | 6.86 |
| 44316.979166666664 | 6.82 |
| 44316.989583333336 | 6.94 |
| 44317.0 | 6.93 |
| 44317.010416666664 | 7.03 |
| 44317.020833333336 | 7.03 |
| 44317.03125 | 6.98 |
| 44317.041666666664 | 6.89 |
| 44317.052083333336 | 6.84 |
| 44317.0625 | 6.83 |
| 44317.072916666664 | 6.82 |
| 44317.083333333336 | 6.85 |
| 44317.09375 | 6.88 |
| 44317.104166666664 | 6.88 |
| 44317.114583333336 | 6.89 |
| 44317.125 | 6.9 |
| 44317.135416666664 | 6.91 |
| 44317.145833333336 | 6.92 |
| 44317.15625 | 6.93 |